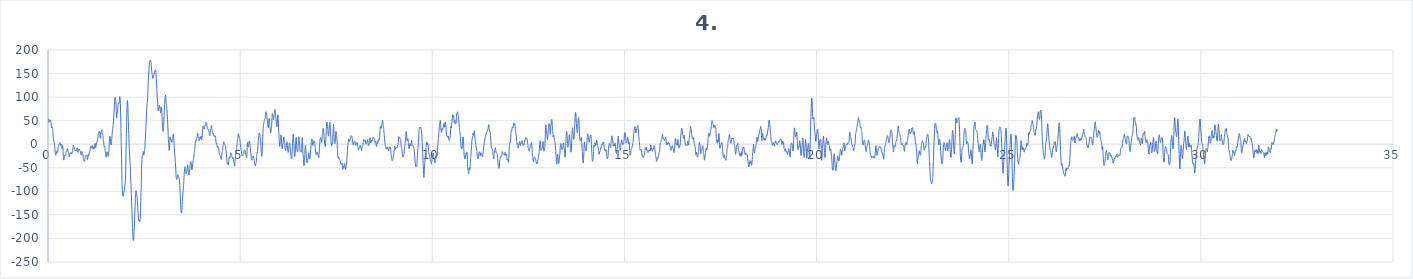
| Category | 4. kanál |
|---|---|
| 0.0 | 47.4 |
| 0.0078125 | 54.3 |
| 0.015625 | 52.2 |
| 0.0234375 | 46.2 |
| 0.03125 | 48.5 |
| 0.0390625 | 52.1 |
| 0.046875 | 50.6 |
| 0.0546875 | 50 |
| 0.0625 | 51 |
| 0.0703125 | 49.9 |
| 0.078125 | 46.2 |
| 0.0859375 | 39.7 |
| 0.09375 | 34.9 |
| 0.1015625 | 35.7 |
| 0.109375 | 36.8 |
| 0.1171875 | 33.7 |
| 0.125 | 27.7 |
| 0.1328125 | 20 |
| 0.140625 | 12.1 |
| 0.1484375 | 7 |
| 0.15625 | 6 |
| 0.1640625 | 3.8 |
| 0.171875 | -4 |
| 0.1796875 | -11.8 |
| 0.1875 | -16.5 |
| 0.1953125 | -21.4 |
| 0.203125 | -23.6 |
| 0.2109375 | -21.3 |
| 0.21875 | -18.7 |
| 0.2265625 | -16.2 |
| 0.234375 | -14 |
| 0.2421875 | -15.8 |
| 0.25 | -17.4 |
| 0.2578125 | -12.1 |
| 0.265625 | -5.2 |
| 0.2734375 | -3 |
| 0.28125 | -1.3 |
| 0.2890625 | 0.6 |
| 0.296875 | 1.2 |
| 0.3046875 | 3.5 |
| 0.3125 | 3.5 |
| 0.3203125 | -1.3 |
| 0.328125 | -2.6 |
| 0.3359375 | -0.4 |
| 0.34375 | 0.3 |
| 0.3515625 | 0.2 |
| 0.359375 | -4.4 |
| 0.3671875 | -9.5 |
| 0.375 | -5.6 |
| 0.3828125 | -3.1 |
| 0.390625 | -13.4 |
| 0.3984375 | -26.4 |
| 0.40625 | -32.9 |
| 0.4140625 | -33 |
| 0.421875 | -27.6 |
| 0.4296875 | -23.7 |
| 0.4375 | -24.8 |
| 0.4453125 | -24.9 |
| 0.453125 | -23.7 |
| 0.4609375 | -23.7 |
| 0.46875 | -20 |
| 0.4765625 | -15.5 |
| 0.484375 | -15.9 |
| 0.4921875 | -15.4 |
| 0.5 | -11 |
| 0.5078125 | -9 |
| 0.515625 | -11.8 |
| 0.5234375 | -15.9 |
| 0.53125 | -17.2 |
| 0.5390625 | -18.6 |
| 0.546875 | -24.1 |
| 0.5546875 | -27 |
| 0.5625 | -24.2 |
| 0.5703125 | -21 |
| 0.578125 | -18.8 |
| 0.5859375 | -18.5 |
| 0.59375 | -19.1 |
| 0.6015625 | -17.8 |
| 0.609375 | -18.6 |
| 0.6171875 | -20.9 |
| 0.625 | -18.4 |
| 0.6328125 | -16 |
| 0.640625 | -15.1 |
| 0.6484375 | -9 |
| 0.65625 | -2 |
| 0.6640625 | -2.5 |
| 0.671875 | -5.4 |
| 0.6796875 | -6.2 |
| 0.6875 | -9.3 |
| 0.6953125 | -12.5 |
| 0.703125 | -12.3 |
| 0.7109375 | -13.3 |
| 0.71875 | -14.5 |
| 0.7265625 | -12.5 |
| 0.734375 | -12.6 |
| 0.7421875 | -13.7 |
| 0.75 | -10.4 |
| 0.7578125 | -7.5 |
| 0.765625 | -10.4 |
| 0.7734375 | -16.2 |
| 0.78125 | -17.2 |
| 0.7890625 | -12.6 |
| 0.796875 | -11.1 |
| 0.8046875 | -12 |
| 0.8125 | -10.5 |
| 0.8203125 | -11.3 |
| 0.828125 | -13.5 |
| 0.8359375 | -13.7 |
| 0.84375 | -16.5 |
| 0.8515625 | -20.3 |
| 0.859375 | -22.2 |
| 0.8671875 | -23.2 |
| 0.875 | -19.8 |
| 0.8828125 | -15.1 |
| 0.890625 | -17.3 |
| 0.8984375 | -20.9 |
| 0.90625 | -21.3 |
| 0.9140625 | -24.7 |
| 0.921875 | -30.5 |
| 0.9296875 | -34.2 |
| 0.9375 | -36.2 |
| 0.9453125 | -36.7 |
| 0.953125 | -35.7 |
| 0.9609375 | -32.7 |
| 0.96875 | -27.7 |
| 0.9765625 | -24 |
| 0.984375 | -23.6 |
| 0.9921875 | -24.2 |
| 1.0 | -23.6 |
| 1.0078125 | -23.2 |
| 1.015625 | -26 |
| 1.0234375 | -31.4 |
| 1.03125 | -33.2 |
| 1.0390625 | -27.6 |
| 1.046875 | -21.2 |
| 1.0546875 | -21.9 |
| 1.0625 | -23.7 |
| 1.0703125 | -19.4 |
| 1.078125 | -15.9 |
| 1.0859375 | -16 |
| 1.09375 | -13.4 |
| 1.1015625 | -7.8 |
| 1.109375 | -4.4 |
| 1.1171875 | -5.6 |
| 1.125 | -8.3 |
| 1.1328125 | -7.9 |
| 1.140625 | -5.7 |
| 1.1484375 | -3.5 |
| 1.15625 | -2.7 |
| 1.1640625 | -7.4 |
| 1.171875 | -10.7 |
| 1.1796875 | -7.2 |
| 1.1875 | -5.7 |
| 1.1953125 | -8.4 |
| 1.203125 | -9.6 |
| 1.2109375 | -6.2 |
| 1.21875 | 0.7 |
| 1.2265625 | 1.7 |
| 1.234375 | -5 |
| 1.2421875 | -7.9 |
| 1.25 | -4.4 |
| 1.2578125 | -0.4 |
| 1.265625 | 2.3 |
| 1.2734375 | 4.3 |
| 1.28125 | 6.6 |
| 1.2890625 | 10.3 |
| 1.296875 | 14.8 |
| 1.3046875 | 18.8 |
| 1.3125 | 22.8 |
| 1.3203125 | 26.3 |
| 1.328125 | 26.5 |
| 1.3359375 | 26.6 |
| 1.34375 | 27.1 |
| 1.3515625 | 20.1 |
| 1.359375 | 12.8 |
| 1.3671875 | 18.2 |
| 1.375 | 24.3 |
| 1.3828125 | 23.5 |
| 1.390625 | 27.1 |
| 1.3984375 | 30.6 |
| 1.40625 | 25.5 |
| 1.4140625 | 21.6 |
| 1.421875 | 20.7 |
| 1.4296875 | 15.4 |
| 1.4375 | 10 |
| 1.4453125 | 7.1 |
| 1.453125 | 0.5 |
| 1.4609375 | -6 |
| 1.46875 | -5.6 |
| 1.4765625 | -4.5 |
| 1.484375 | -9.4 |
| 1.4921875 | -16.7 |
| 1.5 | -22.1 |
| 1.5078125 | -26.5 |
| 1.515625 | -27.3 |
| 1.5234375 | -21.7 |
| 1.53125 | -16.6 |
| 1.5390625 | -16.7 |
| 1.546875 | -18 |
| 1.5546875 | -20.9 |
| 1.5625 | -25.5 |
| 1.5703125 | -25.6 |
| 1.578125 | -20.3 |
| 1.5859375 | -11.8 |
| 1.59375 | 0.1 |
| 1.6015625 | 11.5 |
| 1.609375 | 17 |
| 1.6171875 | 15.4 |
| 1.625 | 9.1 |
| 1.6328125 | 1.7 |
| 1.640625 | -1.5 |
| 1.6484375 | 2.7 |
| 1.65625 | 9.3 |
| 1.6640625 | 15.6 |
| 1.671875 | 24 |
| 1.6796875 | 30.3 |
| 1.6875 | 33.5 |
| 1.6953125 | 40.4 |
| 1.703125 | 49.5 |
| 1.7109375 | 57.5 |
| 1.71875 | 67.9 |
| 1.7265625 | 79.5 |
| 1.734375 | 90 |
| 1.7421875 | 97.5 |
| 1.75 | 99.5 |
| 1.7578125 | 97.3 |
| 1.765625 | 91 |
| 1.7734375 | 76.9 |
| 1.78125 | 60.9 |
| 1.7890625 | 56.2 |
| 1.796875 | 62.6 |
| 1.8046875 | 68.6 |
| 1.8125 | 72.4 |
| 1.8203125 | 78.8 |
| 1.828125 | 85.4 |
| 1.8359375 | 87.7 |
| 1.84375 | 86.4 |
| 1.8515625 | 87.6 |
| 1.859375 | 95 |
| 1.8671875 | 101.1 |
| 1.875 | 98.5 |
| 1.8828125 | 87.2 |
| 1.890625 | 64.7 |
| 1.8984375 | 33.2 |
| 1.90625 | 1.7 |
| 1.9140625 | -29.8 |
| 1.921875 | -62.5 |
| 1.9296875 | -88.2 |
| 1.9375 | -102.7 |
| 1.9453125 | -109.3 |
| 1.953125 | -110.2 |
| 1.9609375 | -107.9 |
| 1.96875 | -103.8 |
| 1.9765625 | -100.9 |
| 1.984375 | -101.6 |
| 1.9921875 | -98.8 |
| 2.0 | -90.5 |
| 2.0078125 | -84.4 |
| 2.015625 | -74.2 |
| 2.0234375 | -49 |
| 2.03125 | -16.4 |
| 2.0390625 | 16.8 |
| 2.046875 | 49.9 |
| 2.0546875 | 75 |
| 2.0625 | 89.1 |
| 2.0703125 | 92.9 |
| 2.078125 | 80.7 |
| 2.0859375 | 59.1 |
| 2.09375 | 40.6 |
| 2.1015625 | 22.2 |
| 2.109375 | 1.8 |
| 2.1171875 | -14 |
| 2.125 | -25.5 |
| 2.1328125 | -36.4 |
| 2.140625 | -48.3 |
| 2.1484375 | -63.9 |
| 2.15625 | -81 |
| 2.1640625 | -96.1 |
| 2.171875 | -113.1 |
| 2.1796875 | -132.1 |
| 2.1875 | -149.5 |
| 2.1953125 | -167.5 |
| 2.203125 | -185.4 |
| 2.2109375 | -197.5 |
| 2.21875 | -204 |
| 2.2265625 | -203.8 |
| 2.234375 | -195 |
| 2.2421875 | -182.5 |
| 2.25 | -167.8 |
| 2.2578125 | -150.1 |
| 2.265625 | -132.1 |
| 2.2734375 | -115.3 |
| 2.28125 | -103.1 |
| 2.2890625 | -98.6 |
| 2.296875 | -100.1 |
| 2.3046875 | -105.5 |
| 2.3125 | -110.3 |
| 2.3203125 | -114.3 |
| 2.328125 | -124.6 |
| 2.3359375 | -137.9 |
| 2.34375 | -146.5 |
| 2.3515625 | -154.2 |
| 2.359375 | -161.3 |
| 2.3671875 | -162.8 |
| 2.375 | -160.7 |
| 2.3828125 | -161.4 |
| 2.390625 | -164 |
| 2.3984375 | -159.3 |
| 2.40625 | -144 |
| 2.4140625 | -123 |
| 2.421875 | -97.7 |
| 2.4296875 | -69.7 |
| 2.4375 | -47.1 |
| 2.4453125 | -31.8 |
| 2.453125 | -23.9 |
| 2.4609375 | -22.6 |
| 2.46875 | -19.7 |
| 2.4765625 | -15.4 |
| 2.484375 | -18.8 |
| 2.4921875 | -23.4 |
| 2.5 | -21.2 |
| 2.5078125 | -18.4 |
| 2.515625 | -13.8 |
| 2.5234375 | -2.5 |
| 2.53125 | 10.7 |
| 2.5390625 | 23.9 |
| 2.546875 | 37.4 |
| 2.5546875 | 49.2 |
| 2.5625 | 61.3 |
| 2.5703125 | 74.3 |
| 2.578125 | 83.5 |
| 2.5859375 | 89.5 |
| 2.59375 | 99.1 |
| 2.6015625 | 115.2 |
| 2.609375 | 133 |
| 2.6171875 | 146.2 |
| 2.625 | 155.8 |
| 2.6328125 | 165.9 |
| 2.640625 | 174.3 |
| 2.6484375 | 176.2 |
| 2.65625 | 176.4 |
| 2.6640625 | 178.8 |
| 2.671875 | 177.6 |
| 2.6796875 | 172.6 |
| 2.6875 | 167.2 |
| 2.6953125 | 158.8 |
| 2.703125 | 151.5 |
| 2.7109375 | 149.8 |
| 2.71875 | 145.3 |
| 2.7265625 | 139.7 |
| 2.734375 | 142.1 |
| 2.7421875 | 145.5 |
| 2.75 | 145.5 |
| 2.7578125 | 147.6 |
| 2.765625 | 151.4 |
| 2.7734375 | 154.1 |
| 2.78125 | 156.3 |
| 2.7890625 | 157.7 |
| 2.796875 | 158.2 |
| 2.8046875 | 155.4 |
| 2.8125 | 148 |
| 2.8203125 | 138.1 |
| 2.828125 | 125.1 |
| 2.8359375 | 110.7 |
| 2.84375 | 99 |
| 2.8515625 | 89.4 |
| 2.859375 | 79.7 |
| 2.8671875 | 72 |
| 2.875 | 70.9 |
| 2.8828125 | 76 |
| 2.890625 | 81.2 |
| 2.8984375 | 82.9 |
| 2.90625 | 81.1 |
| 2.9140625 | 77.2 |
| 2.921875 | 72 |
| 2.9296875 | 66.8 |
| 2.9375 | 67.8 |
| 2.9453125 | 76.2 |
| 2.953125 | 78.8 |
| 2.9609375 | 70 |
| 2.96875 | 56 |
| 2.9765625 | 40.7 |
| 2.984375 | 29.9 |
| 2.9921875 | 27.1 |
| 3.0 | 28.4 |
| 3.0078125 | 35.4 |
| 3.015625 | 49.5 |
| 3.0234375 | 64.7 |
| 3.03125 | 77.7 |
| 3.0390625 | 88.8 |
| 3.046875 | 98.3 |
| 3.0546875 | 104.1 |
| 3.0625 | 100.7 |
| 3.0703125 | 91.9 |
| 3.078125 | 86.3 |
| 3.0859375 | 82.5 |
| 3.09375 | 75.6 |
| 3.1015625 | 64.8 |
| 3.109375 | 52.5 |
| 3.1171875 | 39.7 |
| 3.125 | 24.1 |
| 3.1328125 | 9.3 |
| 3.140625 | 1.2 |
| 3.1484375 | -7.2 |
| 3.15625 | -13.2 |
| 3.1640625 | -3.9 |
| 3.171875 | 11.4 |
| 3.1796875 | 15.9 |
| 3.1875 | 12.1 |
| 3.1953125 | 8.7 |
| 3.203125 | 9 |
| 3.2109375 | 9.6 |
| 3.21875 | 5.4 |
| 3.2265625 | 4 |
| 3.234375 | 9.1 |
| 3.2421875 | 11.8 |
| 3.25 | 14.6 |
| 3.2578125 | 21.7 |
| 3.265625 | 21.1 |
| 3.2734375 | 11.3 |
| 3.28125 | 2.2 |
| 3.2890625 | -7.1 |
| 3.296875 | -18.4 |
| 3.3046875 | -27.9 |
| 3.3125 | -36.4 |
| 3.3203125 | -46.6 |
| 3.328125 | -59.9 |
| 3.3359375 | -70.8 |
| 3.34375 | -73.1 |
| 3.3515625 | -73.7 |
| 3.359375 | -74.8 |
| 3.3671875 | -69.2 |
| 3.375 | -64.7 |
| 3.3828125 | -67.4 |
| 3.390625 | -68.8 |
| 3.3984375 | -69.1 |
| 3.40625 | -71.5 |
| 3.4140625 | -72.6 |
| 3.421875 | -77.3 |
| 3.4296875 | -88.1 |
| 3.4375 | -98.8 |
| 3.4453125 | -112.4 |
| 3.453125 | -130.1 |
| 3.4609375 | -141.8 |
| 3.46875 | -145.3 |
| 3.4765625 | -145.7 |
| 3.484375 | -140.4 |
| 3.4921875 | -128.2 |
| 3.5 | -116.4 |
| 3.5078125 | -107.3 |
| 3.515625 | -98.8 |
| 3.5234375 | -91.8 |
| 3.53125 | -83.1 |
| 3.5390625 | -70.4 |
| 3.546875 | -59.2 |
| 3.5546875 | -51.5 |
| 3.5625 | -47.9 |
| 3.5703125 | -51 |
| 3.578125 | -55.3 |
| 3.5859375 | -57.5 |
| 3.59375 | -62 |
| 3.6015625 | -63.4 |
| 3.609375 | -58.2 |
| 3.6171875 | -54.7 |
| 3.625 | -50.4 |
| 3.6328125 | -43.5 |
| 3.640625 | -47 |
| 3.6484375 | -57.5 |
| 3.65625 | -62.1 |
| 3.6640625 | -64.4 |
| 3.671875 | -65.7 |
| 3.6796875 | -60.6 |
| 3.6875 | -52.7 |
| 3.6953125 | -46 |
| 3.703125 | -40.3 |
| 3.7109375 | -37.1 |
| 3.71875 | -37 |
| 3.7265625 | -42 |
| 3.734375 | -50.2 |
| 3.7421875 | -54.7 |
| 3.75 | -53.5 |
| 3.7578125 | -49.5 |
| 3.765625 | -43 |
| 3.7734375 | -35.7 |
| 3.78125 | -32.4 |
| 3.7890625 | -31.2 |
| 3.796875 | -25.7 |
| 3.8046875 | -19.2 |
| 3.8125 | -16.1 |
| 3.8203125 | -11.2 |
| 3.828125 | -2.8 |
| 3.8359375 | 5.1 |
| 3.84375 | 8.9 |
| 3.8515625 | 7.4 |
| 3.859375 | 7.8 |
| 3.8671875 | 12.5 |
| 3.875 | 13.3 |
| 3.8828125 | 15.2 |
| 3.890625 | 22.1 |
| 3.8984375 | 22.8 |
| 3.90625 | 16.4 |
| 3.9140625 | 12.3 |
| 3.921875 | 11.1 |
| 3.9296875 | 9.3 |
| 3.9375 | 7.4 |
| 3.9453125 | 10 |
| 3.953125 | 14.8 |
| 3.9609375 | 13.5 |
| 3.96875 | 11.9 |
| 3.9765625 | 16.2 |
| 3.984375 | 17.1 |
| 3.9921875 | 11.7 |
| 4.0 | 8.9 |
| 4.0078125 | 12.1 |
| 4.015625 | 19.5 |
| 4.0234375 | 29.1 |
| 4.03125 | 37 |
| 4.0390625 | 39 |
| 4.046875 | 37.4 |
| 4.0546875 | 35.9 |
| 4.0625 | 32.9 |
| 4.0703125 | 32.5 |
| 4.078125 | 37.8 |
| 4.0859375 | 40.4 |
| 4.09375 | 40 |
| 4.1015625 | 43.4 |
| 4.109375 | 46.3 |
| 4.1171875 | 46.1 |
| 4.125 | 45.2 |
| 4.1328125 | 41.5 |
| 4.140625 | 36.1 |
| 4.1484375 | 32.8 |
| 4.15625 | 31.8 |
| 4.1640625 | 31.7 |
| 4.171875 | 31.2 |
| 4.1796875 | 30 |
| 4.1875 | 27.2 |
| 4.1953125 | 22.4 |
| 4.203125 | 18.7 |
| 4.2109375 | 17.9 |
| 4.21875 | 21.8 |
| 4.2265625 | 29 |
| 4.234375 | 32.2 |
| 4.2421875 | 33.5 |
| 4.25 | 38.9 |
| 4.2578125 | 39.5 |
| 4.265625 | 32.7 |
| 4.2734375 | 28.4 |
| 4.28125 | 25.6 |
| 4.2890625 | 22.6 |
| 4.296875 | 23.6 |
| 4.3046875 | 22.6 |
| 4.3125 | 17.9 |
| 4.3203125 | 17.2 |
| 4.328125 | 18.7 |
| 4.3359375 | 17.2 |
| 4.34375 | 15.1 |
| 4.3515625 | 15.9 |
| 4.359375 | 16 |
| 4.3671875 | 9.1 |
| 4.375 | 1.4 |
| 4.3828125 | 1.9 |
| 4.390625 | 2.3 |
| 4.3984375 | -3.8 |
| 4.40625 | -7 |
| 4.4140625 | -5.1 |
| 4.421875 | -5.3 |
| 4.4296875 | -6.2 |
| 4.4375 | -5.6 |
| 4.4453125 | -9.4 |
| 4.453125 | -16.9 |
| 4.4609375 | -21.1 |
| 4.46875 | -22.5 |
| 4.4765625 | -23.7 |
| 4.484375 | -24.4 |
| 4.4921875 | -26.5 |
| 4.5 | -30.2 |
| 4.5078125 | -32.4 |
| 4.515625 | -29.8 |
| 4.5234375 | -21.8 |
| 4.53125 | -16.7 |
| 4.5390625 | -15.8 |
| 4.546875 | -10 |
| 4.5546875 | -2.7 |
| 4.5625 | 0.5 |
| 4.5703125 | 3.9 |
| 4.578125 | 5.2 |
| 4.5859375 | 1.7 |
| 4.59375 | -0.9 |
| 4.6015625 | -1.1 |
| 4.609375 | -1.1 |
| 4.6171875 | -2.8 |
| 4.625 | -7.8 |
| 4.6328125 | -13.8 |
| 4.640625 | -19.9 |
| 4.6484375 | -27.2 |
| 4.65625 | -34.7 |
| 4.6640625 | -40.6 |
| 4.671875 | -41.3 |
| 4.6796875 | -39.4 |
| 4.6875 | -42.2 |
| 4.6953125 | -43.9 |
| 4.703125 | -37.1 |
| 4.7109375 | -29.9 |
| 4.71875 | -27.4 |
| 4.7265625 | -27.9 |
| 4.734375 | -29.7 |
| 4.7421875 | -25.8 |
| 4.75 | -18.7 |
| 4.7578125 | -18.4 |
| 4.765625 | -19.8 |
| 4.7734375 | -20 |
| 4.78125 | -24.6 |
| 4.7890625 | -27.8 |
| 4.796875 | -28.4 |
| 4.8046875 | -31.1 |
| 4.8125 | -30.4 |
| 4.8203125 | -28.6 |
| 4.828125 | -33.1 |
| 4.8359375 | -37.9 |
| 4.84375 | -41.7 |
| 4.8515625 | -46.8 |
| 4.859375 | -45.1 |
| 4.8671875 | -36.3 |
| 4.875 | -28.8 |
| 4.8828125 | -24 |
| 4.890625 | -19.9 |
| 4.8984375 | -16.5 |
| 4.90625 | -12.3 |
| 4.9140625 | -5.4 |
| 4.921875 | 3 |
| 4.9296875 | 8.4 |
| 4.9375 | 12 |
| 4.9453125 | 18 |
| 4.953125 | 22.4 |
| 4.9609375 | 21.1 |
| 4.96875 | 17.8 |
| 4.9765625 | 15.4 |
| 4.984375 | 13.4 |
| 4.9921875 | 10 |
| 5.0 | 4.3 |
| 5.0078125 | -1.6 |
| 5.015625 | -6.7 |
| 5.0234375 | -10.4 |
| 5.03125 | -12.9 |
| 5.0390625 | -18.6 |
| 5.046875 | -24.3 |
| 5.0546875 | -24.6 |
| 5.0625 | -24.6 |
| 5.0703125 | -24.2 |
| 5.078125 | -21.1 |
| 5.0859375 | -20.8 |
| 5.09375 | -20.4 |
| 5.1015625 | -15.7 |
| 5.109375 | -12.7 |
| 5.1171875 | -12.3 |
| 5.125 | -12.1 |
| 5.1328125 | -13.5 |
| 5.140625 | -16.7 |
| 5.1484375 | -20.9 |
| 5.15625 | -23.7 |
| 5.1640625 | -27.2 |
| 5.171875 | -28.8 |
| 5.1796875 | -16 |
| 5.1875 | 2 |
| 5.1953125 | 3.9 |
| 5.203125 | -3.5 |
| 5.2109375 | -5.7 |
| 5.21875 | -4 |
| 5.2265625 | -0.2 |
| 5.234375 | 4.7 |
| 5.2421875 | 7 |
| 5.25 | 4.5 |
| 5.2578125 | -1.9 |
| 5.265625 | -9.2 |
| 5.2734375 | -15.8 |
| 5.28125 | -22 |
| 5.2890625 | -27.8 |
| 5.296875 | -32.2 |
| 5.3046875 | -32.5 |
| 5.3125 | -31.4 |
| 5.3203125 | -32 |
| 5.328125 | -29.6 |
| 5.3359375 | -25.2 |
| 5.34375 | -26.4 |
| 5.3515625 | -29.5 |
| 5.359375 | -30.2 |
| 5.3671875 | -34.5 |
| 5.375 | -40.8 |
| 5.3828125 | -43.3 |
| 5.390625 | -45.2 |
| 5.3984375 | -46 |
| 5.40625 | -42.3 |
| 5.4140625 | -39.3 |
| 5.421875 | -36.1 |
| 5.4296875 | -25.9 |
| 5.4375 | -17.9 |
| 5.4453125 | -18.6 |
| 5.453125 | -16.2 |
| 5.4609375 | -5.6 |
| 5.46875 | 4.8 |
| 5.4765625 | 11.1 |
| 5.484375 | 16.6 |
| 5.4921875 | 22.6 |
| 5.5 | 24.1 |
| 5.5078125 | 20.6 |
| 5.515625 | 18.6 |
| 5.5234375 | 15.6 |
| 5.53125 | 6.4 |
| 5.5390625 | -3 |
| 5.546875 | -10.9 |
| 5.5546875 | -20.7 |
| 5.5625 | -25.9 |
| 5.5703125 | -20 |
| 5.578125 | -7.3 |
| 5.5859375 | 8.4 |
| 5.59375 | 24.8 |
| 5.6015625 | 36.4 |
| 5.609375 | 41.8 |
| 5.6171875 | 44.9 |
| 5.625 | 48.4 |
| 5.6328125 | 51.8 |
| 5.640625 | 53.2 |
| 5.6484375 | 54.1 |
| 5.65625 | 59.7 |
| 5.6640625 | 67 |
| 5.671875 | 69 |
| 5.6796875 | 67.4 |
| 5.6875 | 63.8 |
| 5.6953125 | 58 |
| 5.703125 | 53.8 |
| 5.7109375 | 49.3 |
| 5.71875 | 41.9 |
| 5.7265625 | 36.2 |
| 5.734375 | 35 |
| 5.7421875 | 41.4 |
| 5.75 | 53.1 |
| 5.7578125 | 54.9 |
| 5.765625 | 46.3 |
| 5.7734375 | 39.9 |
| 5.78125 | 32.7 |
| 5.7890625 | 23.9 |
| 5.796875 | 23.7 |
| 5.8046875 | 28.9 |
| 5.8125 | 31.8 |
| 5.8203125 | 39.1 |
| 5.828125 | 54.8 |
| 5.8359375 | 65.4 |
| 5.84375 | 64.7 |
| 5.8515625 | 61.7 |
| 5.859375 | 57.2 |
| 5.8671875 | 51.6 |
| 5.875 | 54.1 |
| 5.8828125 | 60.3 |
| 5.890625 | 63.1 |
| 5.8984375 | 68.3 |
| 5.90625 | 73.9 |
| 5.9140625 | 72.1 |
| 5.921875 | 65 |
| 5.9296875 | 56.2 |
| 5.9375 | 47.9 |
| 5.9453125 | 41.9 |
| 5.953125 | 37.1 |
| 5.9609375 | 38.1 |
| 5.96875 | 49.1 |
| 5.9765625 | 61.3 |
| 5.984375 | 62.4 |
| 5.9921875 | 51.8 |
| 6.0 | 36.9 |
| 6.0078125 | 22.7 |
| 6.015625 | 9.7 |
| 6.0234375 | -1.7 |
| 6.03125 | -4.6 |
| 6.0390625 | 2.6 |
| 6.046875 | 7.7 |
| 6.0546875 | 11.2 |
| 6.0625 | 19.9 |
| 6.0703125 | 19.1 |
| 6.078125 | 4.4 |
| 6.0859375 | -6 |
| 6.09375 | -9.6 |
| 6.1015625 | -9.1 |
| 6.109375 | -1.1 |
| 6.1171875 | 5.1 |
| 6.125 | 7.9 |
| 6.1328125 | 14.5 |
| 6.140625 | 15.6 |
| 6.1484375 | 8.9 |
| 6.15625 | 3.9 |
| 6.1640625 | -2.1 |
| 6.171875 | -10.2 |
| 6.1796875 | -13.6 |
| 6.1875 | -13.2 |
| 6.1953125 | -10.1 |
| 6.203125 | -2.9 |
| 6.2109375 | 3.8 |
| 6.21875 | 5.2 |
| 6.2265625 | 0.9 |
| 6.234375 | -6.9 |
| 6.2421875 | -14.6 |
| 6.25 | -17.4 |
| 6.2578125 | -14.1 |
| 6.265625 | -8.2 |
| 6.2734375 | -2.4 |
| 6.28125 | 2.1 |
| 6.2890625 | 2.8 |
| 6.296875 | -1.6 |
| 6.3046875 | -8.8 |
| 6.3125 | -17.1 |
| 6.3203125 | -25.2 |
| 6.328125 | -29.8 |
| 6.3359375 | -30.8 |
| 6.34375 | -30.5 |
| 6.3515625 | -23.2 |
| 6.359375 | -6.5 |
| 6.3671875 | 9.2 |
| 6.375 | 18.2 |
| 6.3828125 | 21.6 |
| 6.390625 | 15.2 |
| 6.3984375 | 1.9 |
| 6.40625 | -9.9 |
| 6.4140625 | -20.5 |
| 6.421875 | -26.4 |
| 6.4296875 | -21.6 |
| 6.4375 | -11.4 |
| 6.4453125 | 0.9 |
| 6.453125 | 14.1 |
| 6.4609375 | 14.4 |
| 6.46875 | 0 |
| 6.4765625 | -10.8 |
| 6.484375 | -13.6 |
| 6.4921875 | -16.7 |
| 6.5 | -16.1 |
| 6.5078125 | -7.1 |
| 6.515625 | 5.2 |
| 6.5234375 | 14.2 |
| 6.53125 | 16.1 |
| 6.5390625 | 11.9 |
| 6.546875 | 3.4 |
| 6.5546875 | -8 |
| 6.5625 | -14.8 |
| 6.5703125 | -13.7 |
| 6.578125 | -13.5 |
| 6.5859375 | -16.6 |
| 6.59375 | -16.4 |
| 6.6015625 | -9.1 |
| 6.609375 | 5.5 |
| 6.6171875 | 14.1 |
| 6.625 | 3.9 |
| 6.6328125 | -13.9 |
| 6.640625 | -26.8 |
| 6.6484375 | -38 |
| 6.65625 | -45.7 |
| 6.6640625 | -45 |
| 6.671875 | -39.3 |
| 6.6796875 | -29.3 |
| 6.6875 | -13.9 |
| 6.6953125 | -2.7 |
| 6.703125 | -4.1 |
| 6.7109375 | -12.2 |
| 6.71875 | -21 |
| 6.7265625 | -30.8 |
| 6.734375 | -37.9 |
| 6.7421875 | -39.8 |
| 6.75 | -38.2 |
| 6.7578125 | -33.6 |
| 6.765625 | -30.3 |
| 6.7734375 | -27.8 |
| 6.78125 | -21.1 |
| 6.7890625 | -18.2 |
| 6.796875 | -24.7 |
| 6.8046875 | -31 |
| 6.8125 | -31 |
| 6.8203125 | -26.9 |
| 6.828125 | -20.2 |
| 6.8359375 | -12.1 |
| 6.84375 | -3.4 |
| 6.8515625 | 3.5 |
| 6.859375 | 7.7 |
| 6.8671875 | 11.1 |
| 6.875 | 9.1 |
| 6.8828125 | 0.6 |
| 6.890625 | -3 |
| 6.8984375 | 0 |
| 6.90625 | 2.6 |
| 6.9140625 | 5.6 |
| 6.921875 | 7.5 |
| 6.9296875 | 6.3 |
| 6.9375 | 6.2 |
| 6.9453125 | 1.7 |
| 6.953125 | -10 |
| 6.9609375 | -17.6 |
| 6.96875 | -20 |
| 6.9765625 | -22.1 |
| 6.984375 | -19.7 |
| 6.9921875 | -16.4 |
| 7.0 | -16.9 |
| 7.0078125 | -16.8 |
| 7.015625 | -18.1 |
| 7.0234375 | -23 |
| 7.03125 | -26.2 |
| 7.0390625 | -27.6 |
| 7.046875 | -28 |
| 7.0546875 | -21.8 |
| 7.0625 | -9.9 |
| 7.0703125 | 0.8 |
| 7.078125 | 8.6 |
| 7.0859375 | 13.1 |
| 7.09375 | 13.5 |
| 7.1015625 | 13.1 |
| 7.109375 | 10.9 |
| 7.1171875 | 4.4 |
| 7.125 | 4.7 |
| 7.1328125 | 15.4 |
| 7.140625 | 22.8 |
| 7.1484375 | 27 |
| 7.15625 | 33.1 |
| 7.1640625 | 32.7 |
| 7.171875 | 27.4 |
| 7.1796875 | 22 |
| 7.1875 | 11.8 |
| 7.1953125 | 2.7 |
| 7.203125 | -0.5 |
| 7.2109375 | -4.9 |
| 7.21875 | -4.4 |
| 7.2265625 | 7.1 |
| 7.234375 | 19.3 |
| 7.2421875 | 30.4 |
| 7.25 | 42.7 |
| 7.2578125 | 47.2 |
| 7.265625 | 45.1 |
| 7.2734375 | 41.2 |
| 7.28125 | 31.9 |
| 7.2890625 | 22 |
| 7.296875 | 17.3 |
| 7.3046875 | 17.6 |
| 7.3125 | 27 |
| 7.3203125 | 39.6 |
| 7.328125 | 45.4 |
| 7.3359375 | 47.4 |
| 7.34375 | 42.4 |
| 7.3515625 | 26.4 |
| 7.359375 | 12 |
| 7.3671875 | 4 |
| 7.375 | -1.8 |
| 7.3828125 | -2.9 |
| 7.390625 | -1.2 |
| 7.3984375 | 0.5 |
| 7.40625 | 6 |
| 7.4140625 | 17.3 |
| 7.421875 | 32.9 |
| 7.4296875 | 41.8 |
| 7.4375 | 33.4 |
| 7.4453125 | 16.9 |
| 7.453125 | 6.3 |
| 7.4609375 | 1.7 |
| 7.46875 | 2 |
| 7.4765625 | 9 |
| 7.484375 | 19.9 |
| 7.4921875 | 27 |
| 7.5 | 25.8 |
| 7.5078125 | 21 |
| 7.515625 | 15.2 |
| 7.5234375 | 4.9 |
| 7.53125 | -9.6 |
| 7.5390625 | -23.1 |
| 7.546875 | -29.1 |
| 7.5546875 | -27.2 |
| 7.5625 | -27 |
| 7.5703125 | -30.7 |
| 7.578125 | -30.8 |
| 7.5859375 | -29.9 |
| 7.59375 | -31.9 |
| 7.6015625 | -34 |
| 7.609375 | -37.6 |
| 7.6171875 | -42 |
| 7.625 | -41.9 |
| 7.6328125 | -41.1 |
| 7.640625 | -42.7 |
| 7.6484375 | -41.4 |
| 7.65625 | -40.3 |
| 7.6640625 | -46.6 |
| 7.671875 | -52.8 |
| 7.6796875 | -50.1 |
| 7.6875 | -47.6 |
| 7.6953125 | -50.5 |
| 7.703125 | -48 |
| 7.7109375 | -41.4 |
| 7.71875 | -41.9 |
| 7.7265625 | -46.4 |
| 7.734375 | -50.6 |
| 7.7421875 | -53.7 |
| 7.75 | -51.1 |
| 7.7578125 | -46.8 |
| 7.765625 | -44.6 |
| 7.7734375 | -38.4 |
| 7.78125 | -28.5 |
| 7.7890625 | -18.4 |
| 7.796875 | -8.1 |
| 7.8046875 | -0.4 |
| 7.8125 | 5.4 |
| 7.8203125 | 10.8 |
| 7.828125 | 10.4 |
| 7.8359375 | 6.7 |
| 7.84375 | 5.6 |
| 7.8515625 | 5.8 |
| 7.859375 | 7.9 |
| 7.8671875 | 10.7 |
| 7.875 | 12.2 |
| 7.8828125 | 15.9 |
| 7.890625 | 18.2 |
| 7.8984375 | 16.2 |
| 7.90625 | 16.9 |
| 7.9140625 | 13.9 |
| 7.921875 | 4.5 |
| 7.9296875 | 2.1 |
| 7.9375 | 2.2 |
| 7.9453125 | -2.2 |
| 7.953125 | -0.2 |
| 7.9609375 | 5 |
| 7.96875 | 6.2 |
| 7.9765625 | 6.9 |
| 7.984375 | 6.1 |
| 7.9921875 | 3.5 |
| 8.0 | 0.6 |
| 8.0078125 | -2.3 |
| 8.015625 | -1.3 |
| 8.0234375 | 0.2 |
| 8.03125 | 0.5 |
| 8.0390625 | 3.7 |
| 8.046875 | 2.8 |
| 8.0546875 | -2.6 |
| 8.0625 | -5 |
| 8.0703125 | -8.7 |
| 8.078125 | -12.5 |
| 8.0859375 | -10.5 |
| 8.09375 | -8.4 |
| 8.1015625 | -8.4 |
| 8.109375 | -7.5 |
| 8.1171875 | -4.7 |
| 8.125 | -1.7 |
| 8.1328125 | -3.5 |
| 8.140625 | -6.5 |
| 8.1484375 | -8.5 |
| 8.15625 | -13.2 |
| 8.1640625 | -12.8 |
| 8.171875 | -6.9 |
| 8.1796875 | -5.8 |
| 8.1875 | -4.6 |
| 8.1953125 | -0.3 |
| 8.203125 | 3.4 |
| 8.2109375 | 8.4 |
| 8.21875 | 10.6 |
| 8.2265625 | 8 |
| 8.234375 | 6.4 |
| 8.2421875 | 6.2 |
| 8.25 | 7.7 |
| 8.2578125 | 8.9 |
| 8.265625 | 4.4 |
| 8.2734375 | 0 |
| 8.28125 | 1.3 |
| 8.2890625 | 4.1 |
| 8.296875 | 5 |
| 8.3046875 | 6.1 |
| 8.3125 | 10.1 |
| 8.3203125 | 10.6 |
| 8.328125 | 2.7 |
| 8.3359375 | -3.4 |
| 8.34375 | -2.8 |
| 8.3515625 | -0.1 |
| 8.359375 | 4 |
| 8.3671875 | 8.2 |
| 8.375 | 11.5 |
| 8.3828125 | 13.6 |
| 8.390625 | 8.8 |
| 8.3984375 | 2.2 |
| 8.40625 | 4.6 |
| 8.4140625 | 8.7 |
| 8.421875 | 7.1 |
| 8.4296875 | 6.8 |
| 8.4375 | 8.2 |
| 8.4453125 | 9.3 |
| 8.453125 | 12.8 |
| 8.4609375 | 14.4 |
| 8.46875 | 13.4 |
| 8.4765625 | 14.4 |
| 8.484375 | 14.1 |
| 8.4921875 | 11.6 |
| 8.5 | 9.1 |
| 8.5078125 | 4.6 |
| 8.515625 | 3.6 |
| 8.5234375 | 6.9 |
| 8.53125 | 3.3 |
| 8.5390625 | -3.8 |
| 8.546875 | -4.8 |
| 8.5546875 | -1.6 |
| 8.5625 | 3.3 |
| 8.5703125 | 5.2 |
| 8.578125 | 1.5 |
| 8.5859375 | 3.9 |
| 8.59375 | 10.1 |
| 8.6015625 | 8.1 |
| 8.609375 | 7.5 |
| 8.6171875 | 12.1 |
| 8.625 | 11.7 |
| 8.6328125 | 15.5 |
| 8.640625 | 29.4 |
| 8.6484375 | 38.7 |
| 8.65625 | 38.5 |
| 8.6640625 | 34.9 |
| 8.671875 | 33.6 |
| 8.6796875 | 37.5 |
| 8.6875 | 41.2 |
| 8.6953125 | 44.7 |
| 8.703125 | 51.1 |
| 8.7109375 | 50.2 |
| 8.71875 | 42 |
| 8.7265625 | 38.8 |
| 8.734375 | 35.8 |
| 8.7421875 | 26.1 |
| 8.75 | 17.9 |
| 8.7578125 | 12.9 |
| 8.765625 | 5 |
| 8.7734375 | -1.2 |
| 8.78125 | -3.4 |
| 8.7890625 | -7.1 |
| 8.796875 | -9.1 |
| 8.8046875 | -8.2 |
| 8.8125 | -10.6 |
| 8.8203125 | -10.2 |
| 8.828125 | -5.6 |
| 8.8359375 | -6.8 |
| 8.84375 | -9.7 |
| 8.8515625 | -10.4 |
| 8.859375 | -13.9 |
| 8.8671875 | -13.6 |
| 8.875 | -8.1 |
| 8.8828125 | -5.8 |
| 8.890625 | -6.5 |
| 8.8984375 | -8.1 |
| 8.90625 | -7.9 |
| 8.9140625 | -6.7 |
| 8.921875 | -13.2 |
| 8.9296875 | -22.4 |
| 8.9375 | -26.3 |
| 8.9453125 | -30.5 |
| 8.953125 | -34.7 |
| 8.9609375 | -34.4 |
| 8.96875 | -33.1 |
| 8.9765625 | -31 |
| 8.984375 | -27.3 |
| 8.9921875 | -23.6 |
| 9.0 | -18.8 |
| 9.0078125 | -12.8 |
| 9.015625 | -6.9 |
| 9.0234375 | -4.1 |
| 9.03125 | -7.6 |
| 9.0390625 | -11 |
| 9.046875 | -8.7 |
| 9.0546875 | -7.1 |
| 9.0625 | -8.4 |
| 9.0703125 | -7.2 |
| 9.078125 | -6.4 |
| 9.0859375 | -7.8 |
| 9.09375 | -5.1 |
| 9.1015625 | -1.4 |
| 9.109375 | -0.4 |
| 9.1171875 | 6.5 |
| 9.125 | 16 |
| 9.1328125 | 16 |
| 9.140625 | 12.1 |
| 9.1484375 | 13 |
| 9.15625 | 13.5 |
| 9.1640625 | 11.9 |
| 9.171875 | 11.1 |
| 9.1796875 | 7.4 |
| 9.1875 | -1 |
| 9.1953125 | -7 |
| 9.203125 | -7.8 |
| 9.2109375 | -10.6 |
| 9.21875 | -18.9 |
| 9.2265625 | -25.8 |
| 9.234375 | -27.4 |
| 9.2421875 | -27 |
| 9.25 | -25.7 |
| 9.2578125 | -23.4 |
| 9.265625 | -19.6 |
| 9.2734375 | -12 |
| 9.28125 | -5.4 |
| 9.2890625 | -2.1 |
| 9.296875 | 5 |
| 9.3046875 | 13.6 |
| 9.3125 | 20 |
| 9.3203125 | 27 |
| 9.328125 | 25.6 |
| 9.3359375 | 14 |
| 9.34375 | 7.2 |
| 9.3515625 | 7.9 |
| 9.359375 | 11.2 |
| 9.3671875 | 12 |
| 9.375 | 3 |
| 9.3828125 | -6.4 |
| 9.390625 | -7.7 |
| 9.3984375 | -9.1 |
| 9.40625 | -7.9 |
| 9.4140625 | -0.9 |
| 9.421875 | 1.4 |
| 9.4296875 | -0.2 |
| 9.4375 | -1.7 |
| 9.4453125 | -3.5 |
| 9.453125 | 1.2 |
| 9.4609375 | 7.7 |
| 9.46875 | 4.5 |
| 9.4765625 | -0.5 |
| 9.484375 | -0.8 |
| 9.4921875 | -2.9 |
| 9.5 | -4.7 |
| 9.5078125 | -4.1 |
| 9.515625 | -6.3 |
| 9.5234375 | -9.7 |
| 9.53125 | -14.4 |
| 9.5390625 | -22.9 |
| 9.546875 | -30.3 |
| 9.5546875 | -36.9 |
| 9.5625 | -44.2 |
| 9.5703125 | -47.6 |
| 9.578125 | -47.8 |
| 9.5859375 | -47.8 |
| 9.59375 | -46.6 |
| 9.6015625 | -41.6 |
| 9.609375 | -30.4 |
| 9.6171875 | -17.3 |
| 9.625 | -9.6 |
| 9.6328125 | -5.9 |
| 9.640625 | 2 |
| 9.6484375 | 17.4 |
| 9.65625 | 31 |
| 9.6640625 | 35 |
| 9.671875 | 36.1 |
| 9.6796875 | 36.6 |
| 9.6875 | 34.7 |
| 9.6953125 | 35.1 |
| 9.703125 | 35.5 |
| 9.7109375 | 32.1 |
| 9.71875 | 28.4 |
| 9.7265625 | 21.5 |
| 9.734375 | 9.6 |
| 9.7421875 | -3.6 |
| 9.75 | -20.1 |
| 9.7578125 | -35.9 |
| 9.765625 | -47.7 |
| 9.7734375 | -62.2 |
| 9.78125 | -70.6 |
| 9.7890625 | -61.4 |
| 9.796875 | -48.1 |
| 9.8046875 | -40.5 |
| 9.8125 | -32.4 |
| 9.8203125 | -22.1 |
| 9.828125 | -13 |
| 9.8359375 | -7.8 |
| 9.84375 | -3 |
| 9.8515625 | 4.2 |
| 9.859375 | 4.5 |
| 9.8671875 | -1.3 |
| 9.875 | -0.5 |
| 9.8828125 | 2.7 |
| 9.890625 | -0.4 |
| 9.8984375 | -7.7 |
| 9.90625 | -16.1 |
| 9.9140625 | -21 |
| 9.921875 | -22.2 |
| 9.9296875 | -24.6 |
| 9.9375 | -27.7 |
| 9.9453125 | -31.9 |
| 9.953125 | -35.9 |
| 9.9609375 | -35.6 |
| 9.96875 | -37.4 |
| 9.9765625 | -41.7 |
| 9.984375 | -39.2 |
| 9.9921875 | -32.4 |
| 10.0 | -27.4 |
| 10.0078125 | -22.9 |
| 10.015625 | -19.6 |
| 10.0234375 | -18.8 |
| 10.03125 | -22.7 |
| 10.0390625 | -29.3 |
| 10.046875 | -30.7 |
| 10.0546875 | -30.8 |
| 10.0625 | -36.9 |
| 10.0703125 | -39.4 |
| 10.078125 | -34.2 |
| 10.0859375 | -31.5 |
| 10.09375 | -31.8 |
| 10.1015625 | -28.5 |
| 10.109375 | -24.2 |
| 10.1171875 | -24.3 |
| 10.125 | -25.2 |
| 10.1328125 | -18.8 |
| 10.140625 | -6.3 |
| 10.1484375 | 3.9 |
| 10.15625 | 9.4 |
| 10.1640625 | 15.4 |
| 10.171875 | 24.5 |
| 10.1796875 | 34.4 |
| 10.1875 | 41.6 |
| 10.1953125 | 46.2 |
| 10.203125 | 50.5 |
| 10.2109375 | 50.5 |
| 10.21875 | 41.2 |
| 10.2265625 | 29.8 |
| 10.234375 | 25.2 |
| 10.2421875 | 27.3 |
| 10.25 | 32.2 |
| 10.2578125 | 33.4 |
| 10.265625 | 30.9 |
| 10.2734375 | 31.8 |
| 10.28125 | 36.1 |
| 10.2890625 | 39.3 |
| 10.296875 | 42.9 |
| 10.3046875 | 43.6 |
| 10.3125 | 38.5 |
| 10.3203125 | 35.9 |
| 10.328125 | 41.5 |
| 10.3359375 | 46.8 |
| 10.34375 | 45.3 |
| 10.3515625 | 39.9 |
| 10.359375 | 33 |
| 10.3671875 | 23.8 |
| 10.375 | 17.8 |
| 10.3828125 | 17.8 |
| 10.390625 | 16.8 |
| 10.3984375 | 14.9 |
| 10.40625 | 16.8 |
| 10.4140625 | 17.3 |
| 10.421875 | 13.1 |
| 10.4296875 | 9.7 |
| 10.4375 | 8 |
| 10.4453125 | 8.2 |
| 10.453125 | 10.9 |
| 10.4609375 | 12.6 |
| 10.46875 | 18.2 |
| 10.4765625 | 31.7 |
| 10.484375 | 38.1 |
| 10.4921875 | 34.3 |
| 10.5 | 37.8 |
| 10.5078125 | 46.5 |
| 10.515625 | 50.8 |
| 10.5234375 | 57.4 |
| 10.53125 | 63.1 |
| 10.5390625 | 60.7 |
| 10.546875 | 59.5 |
| 10.5546875 | 60.5 |
| 10.5625 | 53.5 |
| 10.5703125 | 46.1 |
| 10.578125 | 48.7 |
| 10.5859375 | 50.9 |
| 10.59375 | 45.3 |
| 10.6015625 | 42.6 |
| 10.609375 | 43.5 |
| 10.6171875 | 43.6 |
| 10.625 | 51.2 |
| 10.6328125 | 62 |
| 10.640625 | 65.3 |
| 10.6484375 | 67.6 |
| 10.65625 | 69 |
| 10.6640625 | 65.1 |
| 10.671875 | 62.3 |
| 10.6796875 | 59.1 |
| 10.6875 | 51.8 |
| 10.6953125 | 44.5 |
| 10.703125 | 37.6 |
| 10.7109375 | 31.7 |
| 10.71875 | 26.8 |
| 10.7265625 | 20 |
| 10.734375 | 10.9 |
| 10.7421875 | 1 |
| 10.75 | -5.3 |
| 10.7578125 | -7.3 |
| 10.765625 | -10 |
| 10.7734375 | -9.9 |
| 10.78125 | -1.9 |
| 10.7890625 | 8.7 |
| 10.796875 | 15.8 |
| 10.8046875 | 15.2 |
| 10.8125 | 5 |
| 10.8203125 | -9.3 |
| 10.828125 | -20.6 |
| 10.8359375 | -27.3 |
| 10.84375 | -31.1 |
| 10.8515625 | -31 |
| 10.859375 | -27.5 |
| 10.8671875 | -24.3 |
| 10.875 | -20 |
| 10.8828125 | -18.3 |
| 10.890625 | -21.7 |
| 10.8984375 | -19.3 |
| 10.90625 | -17.3 |
| 10.9140625 | -32.6 |
| 10.921875 | -50.2 |
| 10.9296875 | -54.6 |
| 10.9375 | -57.8 |
| 10.9453125 | -62.5 |
| 10.953125 | -58.2 |
| 10.9609375 | -49.8 |
| 10.96875 | -49.7 |
| 10.9765625 | -53.8 |
| 10.984375 | -49.4 |
| 10.9921875 | -38.8 |
| 11.0 | -28.4 |
| 11.0078125 | -18.9 |
| 11.015625 | -11.9 |
| 11.0234375 | -2.9 |
| 11.03125 | 8.8 |
| 11.0390625 | 12.7 |
| 11.046875 | 12 |
| 11.0546875 | 17.5 |
| 11.0625 | 23.6 |
| 11.0703125 | 22.5 |
| 11.078125 | 19 |
| 11.0859375 | 22.1 |
| 11.09375 | 28.4 |
| 11.1015625 | 24.7 |
| 11.109375 | 13.6 |
| 11.1171875 | 7.3 |
| 11.125 | 3.7 |
| 11.1328125 | -0.7 |
| 11.140625 | -5.1 |
| 11.1484375 | -10.1 |
| 11.15625 | -13.6 |
| 11.1640625 | -17.1 |
| 11.171875 | -25.4 |
| 11.1796875 | -30.8 |
| 11.1875 | -29.1 |
| 11.1953125 | -29.5 |
| 11.203125 | -28.5 |
| 11.2109375 | -21.1 |
| 11.21875 | -17.3 |
| 11.2265625 | -17.3 |
| 11.234375 | -16.1 |
| 11.2421875 | -20.5 |
| 11.25 | -24.5 |
| 11.2578125 | -19.8 |
| 11.265625 | -18.2 |
| 11.2734375 | -20.8 |
| 11.28125 | -19.8 |
| 11.2890625 | -21.8 |
| 11.296875 | -26.5 |
| 11.3046875 | -26.5 |
| 11.3125 | -23.8 |
| 11.3203125 | -18.9 |
| 11.328125 | -13 |
| 11.3359375 | -8.6 |
| 11.34375 | -2.9 |
| 11.3515625 | 2.9 |
| 11.359375 | 6.5 |
| 11.3671875 | 9.6 |
| 11.375 | 12.5 |
| 11.3828125 | 15.9 |
| 11.390625 | 19.7 |
| 11.3984375 | 22.1 |
| 11.40625 | 24.1 |
| 11.4140625 | 25.4 |
| 11.421875 | 25.7 |
| 11.4296875 | 28.5 |
| 11.4375 | 31.3 |
| 11.4453125 | 31 |
| 11.453125 | 33.6 |
| 11.4609375 | 39.6 |
| 11.46875 | 41.7 |
| 11.4765625 | 38.5 |
| 11.484375 | 33 |
| 11.4921875 | 27.9 |
| 11.5 | 26.1 |
| 11.5078125 | 24.9 |
| 11.515625 | 18.7 |
| 11.5234375 | 8.2 |
| 11.53125 | -1.9 |
| 11.5390625 | -7.6 |
| 11.546875 | -9.3 |
| 11.5546875 | -9.8 |
| 11.5625 | -9.9 |
| 11.5703125 | -12.6 |
| 11.578125 | -20.1 |
| 11.5859375 | -26.6 |
| 11.59375 | -30.1 |
| 11.6015625 | -31 |
| 11.609375 | -24 |
| 11.6171875 | -14.6 |
| 11.625 | -12.2 |
| 11.6328125 | -10.6 |
| 11.640625 | -7.4 |
| 11.6484375 | -10.5 |
| 11.65625 | -16.9 |
| 11.6640625 | -18.5 |
| 11.671875 | -17.8 |
| 11.6796875 | -19.6 |
| 11.6875 | -20.4 |
| 11.6953125 | -21.6 |
| 11.703125 | -30.7 |
| 11.7109375 | -41.4 |
| 11.71875 | -43.5 |
| 11.7265625 | -45.3 |
| 11.734375 | -51.5 |
| 11.7421875 | -49.5 |
| 11.75 | -38.8 |
| 11.7578125 | -32.8 |
| 11.765625 | -31.6 |
| 11.7734375 | -28.1 |
| 11.78125 | -25.5 |
| 11.7890625 | -26.1 |
| 11.796875 | -26.1 |
| 11.8046875 | -24.2 |
| 11.8125 | -20.3 |
| 11.8203125 | -15.8 |
| 11.828125 | -15.9 |
| 11.8359375 | -18.4 |
| 11.84375 | -18.9 |
| 11.8515625 | -20 |
| 11.859375 | -21.5 |
| 11.8671875 | -22.8 |
| 11.875 | -23.5 |
| 11.8828125 | -20.1 |
| 11.890625 | -17.1 |
| 11.8984375 | -19.7 |
| 11.90625 | -22.2 |
| 11.9140625 | -23.4 |
| 11.921875 | -22.5 |
| 11.9296875 | -20.5 |
| 11.9375 | -26.5 |
| 11.9453125 | -33.7 |
| 11.953125 | -32 |
| 11.9609375 | -31.7 |
| 11.96875 | -34.7 |
| 11.9765625 | -36.2 |
| 11.984375 | -38.3 |
| 11.9921875 | -30.9 |
| 12.0 | -13.3 |
| 12.0078125 | -2.1 |
| 12.015625 | 2.3 |
| 12.0234375 | 4.8 |
| 12.03125 | 3.8 |
| 12.0390625 | 9.1 |
| 12.046875 | 22.3 |
| 12.0546875 | 28.3 |
| 12.0625 | 27.4 |
| 12.0703125 | 29.9 |
| 12.078125 | 34.7 |
| 12.0859375 | 36.6 |
| 12.09375 | 35.6 |
| 12.1015625 | 34.8 |
| 12.109375 | 39.3 |
| 12.1171875 | 45.2 |
| 12.125 | 44.3 |
| 12.1328125 | 41.6 |
| 12.140625 | 43 |
| 12.1484375 | 42.8 |
| 12.15625 | 37 |
| 12.1640625 | 30.5 |
| 12.171875 | 27.3 |
| 12.1796875 | 23 |
| 12.1875 | 15.4 |
| 12.1953125 | 8.5 |
| 12.203125 | 2.8 |
| 12.2109375 | -0.1 |
| 12.21875 | 1 |
| 12.2265625 | -2.5 |
| 12.234375 | -8.1 |
| 12.2421875 | -4.7 |
| 12.25 | -0.5 |
| 12.2578125 | -0.7 |
| 12.265625 | 2.8 |
| 12.2734375 | 5.9 |
| 12.28125 | 2.6 |
| 12.2890625 | -2 |
| 12.296875 | -2.7 |
| 12.3046875 | 0.6 |
| 12.3125 | 2.2 |
| 12.3203125 | 1.8 |
| 12.328125 | 5.5 |
| 12.3359375 | 7.5 |
| 12.34375 | 3.9 |
| 12.3515625 | 1.4 |
| 12.359375 | -1.1 |
| 12.3671875 | -3.9 |
| 12.375 | -1.9 |
| 12.3828125 | -0.8 |
| 12.390625 | -1.4 |
| 12.3984375 | 4 |
| 12.40625 | 8.9 |
| 12.4140625 | 8.4 |
| 12.421875 | 10.6 |
| 12.4296875 | 14.4 |
| 12.4375 | 13.6 |
| 12.4453125 | 11.8 |
| 12.453125 | 12.2 |
| 12.4609375 | 12.5 |
| 12.46875 | 10.6 |
| 12.4765625 | 6.4 |
| 12.484375 | -0.2 |
| 12.4921875 | -6.5 |
| 12.5 | -8.5 |
| 12.5078125 | -9.7 |
| 12.515625 | -13.9 |
| 12.5234375 | -15 |
| 12.53125 | -11.6 |
| 12.5390625 | -8.3 |
| 12.546875 | -4.4 |
| 12.5546875 | -1.9 |
| 12.5625 | -2 |
| 12.5703125 | 0.2 |
| 12.578125 | 3.3 |
| 12.5859375 | 1.5 |
| 12.59375 | -6.3 |
| 12.6015625 | -17.1 |
| 12.609375 | -24 |
| 12.6171875 | -28 |
| 12.625 | -34.5 |
| 12.6328125 | -38.1 |
| 12.640625 | -34.4 |
| 12.6484375 | -29.9 |
| 12.65625 | -27.8 |
| 12.6640625 | -27 |
| 12.671875 | -27.6 |
| 12.6796875 | -29.9 |
| 12.6875 | -32.1 |
| 12.6953125 | -34.3 |
| 12.703125 | -39.1 |
| 12.7109375 | -42 |
| 12.71875 | -38.9 |
| 12.7265625 | -38.6 |
| 12.734375 | -41 |
| 12.7421875 | -37.3 |
| 12.75 | -32.7 |
| 12.7578125 | -30.6 |
| 12.765625 | -25.3 |
| 12.7734375 | -19.8 |
| 12.78125 | -15.1 |
| 12.7890625 | -7.9 |
| 12.796875 | -0.4 |
| 12.8046875 | 6.5 |
| 12.8125 | 7.2 |
| 12.8203125 | -3.9 |
| 12.828125 | -13.7 |
| 12.8359375 | -12.7 |
| 12.84375 | -10.9 |
| 12.8515625 | -10.8 |
| 12.859375 | -8 |
| 12.8671875 | -2.7 |
| 12.875 | 5.1 |
| 12.8828125 | 6 |
| 12.890625 | -5.7 |
| 12.8984375 | -14.8 |
| 12.90625 | -14.5 |
| 12.9140625 | -13.9 |
| 12.921875 | -12 |
| 12.9296875 | -3.5 |
| 12.9375 | 12.9 |
| 12.9453125 | 32.2 |
| 12.953125 | 41.1 |
| 12.9609375 | 35.9 |
| 12.96875 | 28.4 |
| 12.9765625 | 23.8 |
| 12.984375 | 17.8 |
| 12.9921875 | 11.1 |
| 13.0 | 10.3 |
| 13.0078125 | 17.2 |
| 13.015625 | 25.9 |
| 13.0234375 | 33.6 |
| 13.03125 | 40.6 |
| 13.0390625 | 43.8 |
| 13.046875 | 42.9 |
| 13.0546875 | 39.9 |
| 13.0625 | 31.1 |
| 13.0703125 | 21.1 |
| 13.078125 | 24.1 |
| 13.0859375 | 36.9 |
| 13.09375 | 45 |
| 13.1015625 | 49.6 |
| 13.109375 | 53 |
| 13.1171875 | 47.5 |
| 13.125 | 37.1 |
| 13.1328125 | 29.5 |
| 13.140625 | 20.8 |
| 13.1484375 | 15 |
| 13.15625 | 17.7 |
| 13.1640625 | 18.7 |
| 13.171875 | 12.9 |
| 13.1796875 | 8.4 |
| 13.1875 | 7.1 |
| 13.1953125 | 3.6 |
| 13.203125 | -3.7 |
| 13.2109375 | -13.2 |
| 13.21875 | -23.5 |
| 13.2265625 | -34 |
| 13.234375 | -42.2 |
| 13.2421875 | -42.3 |
| 13.25 | -31.9 |
| 13.2578125 | -21 |
| 13.265625 | -22 |
| 13.2734375 | -29.7 |
| 13.28125 | -35.2 |
| 13.2890625 | -40.8 |
| 13.296875 | -39.7 |
| 13.3046875 | -29.4 |
| 13.3125 | -24.7 |
| 13.3203125 | -20.8 |
| 13.328125 | -7.8 |
| 13.3359375 | 0.6 |
| 13.34375 | 1.5 |
| 13.3515625 | 0.5 |
| 13.359375 | -5.9 |
| 13.3671875 | -10.6 |
| 13.375 | -9.6 |
| 13.3828125 | -10.7 |
| 13.390625 | -10.7 |
| 13.3984375 | -5.9 |
| 13.40625 | -0.2 |
| 13.4140625 | 2.4 |
| 13.421875 | -1.3 |
| 13.4296875 | -7 |
| 13.4375 | -12.8 |
| 13.4453125 | -21.6 |
| 13.453125 | -27.6 |
| 13.4609375 | -24.6 |
| 13.46875 | -12.3 |
| 13.4765625 | 5.7 |
| 13.484375 | 19.5 |
| 13.4921875 | 25.2 |
| 13.5 | 26.5 |
| 13.5078125 | 20.9 |
| 13.515625 | 8.1 |
| 13.5234375 | -3.3 |
| 13.53125 | -6.2 |
| 13.5390625 | -2.6 |
| 13.546875 | 1.8 |
| 13.5546875 | 9.8 |
| 13.5625 | 19.4 |
| 13.5703125 | 20.5 |
| 13.578125 | 14.6 |
| 13.5859375 | 6.9 |
| 13.59375 | -2.8 |
| 13.6015625 | -11.7 |
| 13.609375 | -17 |
| 13.6171875 | -14.1 |
| 13.625 | 0.5 |
| 13.6328125 | 17 |
| 13.640625 | 28.5 |
| 13.6484375 | 35.2 |
| 13.65625 | 32.7 |
| 13.6640625 | 23.7 |
| 13.671875 | 15.8 |
| 13.6796875 | 10.5 |
| 13.6875 | 10.7 |
| 13.6953125 | 19.1 |
| 13.703125 | 32.4 |
| 13.7109375 | 46.9 |
| 13.71875 | 59.6 |
| 13.7265625 | 67.4 |
| 13.734375 | 67.1 |
| 13.7421875 | 56.9 |
| 13.75 | 43.6 |
| 13.7578125 | 34.6 |
| 13.765625 | 28.6 |
| 13.7734375 | 24.6 |
| 13.78125 | 28.6 |
| 13.7890625 | 40.6 |
| 13.796875 | 52.1 |
| 13.8046875 | 56.8 |
| 13.8125 | 53.6 |
| 13.8203125 | 43 |
| 13.828125 | 28.7 |
| 13.8359375 | 15.7 |
| 13.84375 | 8.2 |
| 13.8515625 | 7.2 |
| 13.859375 | 8.8 |
| 13.8671875 | 11.3 |
| 13.875 | 14.5 |
| 13.8828125 | 13.1 |
| 13.890625 | 3.6 |
| 13.8984375 | -9.2 |
| 13.90625 | -22.1 |
| 13.9140625 | -32.5 |
| 13.921875 | -37.9 |
| 13.9296875 | -40 |
| 13.9375 | -34 |
| 13.9453125 | -15.8 |
| 13.953125 | 1.4 |
| 13.9609375 | 5.1 |
| 13.96875 | -1.2 |
| 13.9765625 | -6.7 |
| 13.984375 | -7.5 |
| 13.9921875 | -10.1 |
| 14.0 | -14.7 |
| 14.0078125 | -12 |
| 14.015625 | -4.2 |
| 14.0234375 | 3.2 |
| 14.03125 | 13.7 |
| 14.0390625 | 22 |
| 14.046875 | 21.1 |
| 14.0546875 | 17.4 |
| 14.0625 | 13.7 |
| 14.0703125 | 8.2 |
| 14.078125 | 4.3 |
| 14.0859375 | 4.8 |
| 14.09375 | 9.1 |
| 14.1015625 | 14.2 |
| 14.109375 | 16.3 |
| 14.1171875 | 17.9 |
| 14.125 | 19.9 |
| 14.1328125 | 15.5 |
| 14.140625 | 2.4 |
| 14.1484375 | -12.8 |
| 14.15625 | -25.5 |
| 14.1640625 | -34.4 |
| 14.171875 | -36.2 |
| 14.1796875 | -32.3 |
| 14.1875 | -28 |
| 14.1953125 | -18.9 |
| 14.203125 | -5.7 |
| 14.2109375 | -2.1 |
| 14.21875 | -4.5 |
| 14.2265625 | 0.2 |
| 14.234375 | 3.2 |
| 14.2421875 | -1.4 |
| 14.25 | -3.2 |
| 14.2578125 | -1.3 |
| 14.265625 | 1.8 |
| 14.2734375 | 7.5 |
| 14.28125 | 8.9 |
| 14.2890625 | 2.9 |
| 14.296875 | -2.1 |
| 14.3046875 | -4.3 |
| 14.3125 | -6.2 |
| 14.3203125 | -8 |
| 14.328125 | -13.7 |
| 14.3359375 | -21.2 |
| 14.34375 | -21.3 |
| 14.3515625 | -16.6 |
| 14.359375 | -15.8 |
| 14.3671875 | -15.3 |
| 14.375 | -10.3 |
| 14.3828125 | -7.5 |
| 14.390625 | -9 |
| 14.3984375 | -5.7 |
| 14.40625 | -0.2 |
| 14.4140625 | -1.5 |
| 14.421875 | -1.5 |
| 14.4296875 | 3.4 |
| 14.4375 | 3.1 |
| 14.4453125 | 1.4 |
| 14.453125 | 4.2 |
| 14.4609375 | 3.8 |
| 14.46875 | -1.2 |
| 14.4765625 | -7.3 |
| 14.484375 | -11.3 |
| 14.4921875 | -10.5 |
| 14.5 | -11.4 |
| 14.5078125 | -14.7 |
| 14.515625 | -12.8 |
| 14.5234375 | -11.3 |
| 14.53125 | -17.9 |
| 14.5390625 | -26.1 |
| 14.546875 | -30.3 |
| 14.5546875 | -31.3 |
| 14.5625 | -30.3 |
| 14.5703125 | -26.9 |
| 14.578125 | -18.7 |
| 14.5859375 | -9 |
| 14.59375 | -3.4 |
| 14.6015625 | -0.4 |
| 14.609375 | 1.8 |
| 14.6171875 | 0.8 |
| 14.625 | -2.7 |
| 14.6328125 | -6.2 |
| 14.640625 | -6.9 |
| 14.6484375 | -1.7 |
| 14.65625 | 6.1 |
| 14.6640625 | 12.3 |
| 14.671875 | 17.2 |
| 14.6796875 | 17.3 |
| 14.6875 | 11.7 |
| 14.6953125 | 7.2 |
| 14.703125 | 2 |
| 14.7109375 | -4.1 |
| 14.71875 | -3.1 |
| 14.7265625 | -0.8 |
| 14.734375 | -3.6 |
| 14.7421875 | -3 |
| 14.75 | 1.6 |
| 14.7578125 | 2.8 |
| 14.765625 | -1.3 |
| 14.7734375 | -9.6 |
| 14.78125 | -16.8 |
| 14.7890625 | -19.8 |
| 14.796875 | -19.6 |
| 14.8046875 | -14.7 |
| 14.8125 | -7.9 |
| 14.8203125 | -1.6 |
| 14.828125 | 9 |
| 14.8359375 | 17.3 |
| 14.84375 | 14.4 |
| 14.8515625 | 7.6 |
| 14.859375 | 1 |
| 14.8671875 | -5.9 |
| 14.875 | -7.8 |
| 14.8828125 | -8.9 |
| 14.890625 | -13.4 |
| 14.8984375 | -10.8 |
| 14.90625 | -2.4 |
| 14.9140625 | 2.3 |
| 14.921875 | 6.4 |
| 14.9296875 | 9.1 |
| 14.9375 | 6.1 |
| 14.9453125 | 2.9 |
| 14.953125 | 0.6 |
| 14.9609375 | -1.3 |
| 14.96875 | -0.2 |
| 14.9765625 | 0.4 |
| 14.984375 | 2.9 |
| 14.9921875 | 11.3 |
| 15.0 | 19.9 |
| 15.0078125 | 24.9 |
| 15.015625 | 24.4 |
| 15.0234375 | 19.2 |
| 15.03125 | 14.1 |
| 15.0390625 | 7.7 |
| 15.046875 | 2.9 |
| 15.0546875 | 2.7 |
| 15.0625 | 2.7 |
| 15.0703125 | 6.8 |
| 15.078125 | 13.9 |
| 15.0859375 | 14.5 |
| 15.09375 | 11.9 |
| 15.1015625 | 6.9 |
| 15.109375 | 0.5 |
| 15.1171875 | 2.7 |
| 15.125 | 4.1 |
| 15.1328125 | -8 |
| 15.140625 | -19.9 |
| 15.1484375 | -23.1 |
| 15.15625 | -23.2 |
| 15.1640625 | -19.2 |
| 15.171875 | -13.3 |
| 15.1796875 | -10.7 |
| 15.1875 | -9.3 |
| 15.1953125 | -7.3 |
| 15.203125 | -4.4 |
| 15.2109375 | -0.9 |
| 15.21875 | 1.7 |
| 15.2265625 | 5.4 |
| 15.234375 | 13.6 |
| 15.2421875 | 23 |
| 15.25 | 29.8 |
| 15.2578125 | 33.3 |
| 15.265625 | 35 |
| 15.2734375 | 37.7 |
| 15.28125 | 36.1 |
| 15.2890625 | 27.1 |
| 15.296875 | 23.8 |
| 15.3046875 | 29.7 |
| 15.3125 | 32.1 |
| 15.3203125 | 31.8 |
| 15.328125 | 35 |
| 15.3359375 | 36.9 |
| 15.34375 | 37.9 |
| 15.3515625 | 39.5 |
| 15.359375 | 35.3 |
| 15.3671875 | 25.7 |
| 15.375 | 15.9 |
| 15.3828125 | 8.4 |
| 15.390625 | 2.9 |
| 15.3984375 | -4.8 |
| 15.40625 | -12 |
| 15.4140625 | -12.2 |
| 15.421875 | -11.4 |
| 15.4296875 | -12.7 |
| 15.4375 | -11.2 |
| 15.4453125 | -13 |
| 15.453125 | -20.9 |
| 15.4609375 | -24.8 |
| 15.46875 | -23.8 |
| 15.4765625 | -25.4 |
| 15.484375 | -28.4 |
| 15.4921875 | -28.5 |
| 15.5 | -25.8 |
| 15.5078125 | -23.6 |
| 15.515625 | -23.6 |
| 15.5234375 | -21.8 |
| 15.53125 | -15 |
| 15.5390625 | -9.1 |
| 15.546875 | -10.2 |
| 15.5546875 | -11.5 |
| 15.5625 | -7.2 |
| 15.5703125 | -6.2 |
| 15.578125 | -11.1 |
| 15.5859375 | -12.8 |
| 15.59375 | -11.9 |
| 15.6015625 | -14.5 |
| 15.609375 | -17.6 |
| 15.6171875 | -17.1 |
| 15.625 | -14.6 |
| 15.6328125 | -13.6 |
| 15.640625 | -14.9 |
| 15.6484375 | -14.4 |
| 15.65625 | -11.8 |
| 15.6640625 | -13.1 |
| 15.671875 | -13.9 |
| 15.6796875 | -7 |
| 15.6875 | -1.5 |
| 15.6953125 | -3.6 |
| 15.703125 | -6.7 |
| 15.7109375 | -10.1 |
| 15.71875 | -14 |
| 15.7265625 | -14.7 |
| 15.734375 | -13.4 |
| 15.7421875 | -10.6 |
| 15.75 | -8.7 |
| 15.7578125 | -10.4 |
| 15.765625 | -8.2 |
| 15.7734375 | -3 |
| 15.78125 | -4.3 |
| 15.7890625 | -7.9 |
| 15.796875 | -11.5 |
| 15.8046875 | -18.6 |
| 15.8125 | -23.9 |
| 15.8203125 | -27.2 |
| 15.828125 | -32.8 |
| 15.8359375 | -36.5 |
| 15.84375 | -35 |
| 15.8515625 | -31.9 |
| 15.859375 | -29.4 |
| 15.8671875 | -28.3 |
| 15.875 | -28.7 |
| 15.8828125 | -28.5 |
| 15.890625 | -25 |
| 15.8984375 | -19.9 |
| 15.90625 | -17.3 |
| 15.9140625 | -14.8 |
| 15.921875 | -7.8 |
| 15.9296875 | 0.4 |
| 15.9375 | 3.7 |
| 15.9453125 | 4.1 |
| 15.953125 | 6.5 |
| 15.9609375 | 9.6 |
| 15.96875 | 10.1 |
| 15.9765625 | 12.4 |
| 15.984375 | 19 |
| 15.9921875 | 21.4 |
| 16.0 | 15.8 |
| 16.0078125 | 11.1 |
| 16.015625 | 11.7 |
| 16.0234375 | 11.1 |
| 16.03125 | 8.7 |
| 16.0390625 | 8.3 |
| 16.046875 | 8.2 |
| 16.0546875 | 9.2 |
| 16.0625 | 13.2 |
| 16.0703125 | 15.3 |
| 16.078125 | 12.3 |
| 16.0859375 | 7.3 |
| 16.09375 | 2.5 |
| 16.1015625 | -1.6 |
| 16.109375 | -1.3 |
| 16.1171875 | 2.3 |
| 16.125 | 2 |
| 16.1328125 | 0.7 |
| 16.140625 | 4.2 |
| 16.1484375 | 4.8 |
| 16.15625 | 1.8 |
| 16.1640625 | 2.3 |
| 16.171875 | 1.1 |
| 16.1796875 | -3.9 |
| 16.1875 | -5.5 |
| 16.1953125 | -5.2 |
| 16.203125 | -8.9 |
| 16.2109375 | -13 |
| 16.21875 | -11.1 |
| 16.2265625 | -6.7 |
| 16.234375 | -5.5 |
| 16.2421875 | -4.2 |
| 16.25 | -3.1 |
| 16.2578125 | -5.8 |
| 16.265625 | -8.3 |
| 16.2734375 | -12 |
| 16.28125 | -17.3 |
| 16.2890625 | -17 |
| 16.296875 | -15.5 |
| 16.3046875 | -13.7 |
| 16.3125 | -2.8 |
| 16.3203125 | 9.5 |
| 16.328125 | 12.6 |
| 16.3359375 | 9.3 |
| 16.34375 | 2.2 |
| 16.3515625 | -1.7 |
| 16.359375 | 1.2 |
| 16.3671875 | 0.6 |
| 16.375 | -2.2 |
| 16.3828125 | 3.6 |
| 16.390625 | 10.2 |
| 16.3984375 | 7.2 |
| 16.40625 | -0.1 |
| 16.4140625 | -6 |
| 16.421875 | -8.3 |
| 16.4296875 | -5.1 |
| 16.4375 | -2.3 |
| 16.4453125 | -3 |
| 16.453125 | 1 |
| 16.4609375 | 9.8 |
| 16.46875 | 17.3 |
| 16.4765625 | 25.7 |
| 16.484375 | 33.3 |
| 16.4921875 | 33.9 |
| 16.5 | 30.4 |
| 16.5078125 | 26.7 |
| 16.515625 | 22.2 |
| 16.5234375 | 18.9 |
| 16.53125 | 15.7 |
| 16.5390625 | 12.2 |
| 16.546875 | 14.3 |
| 16.5546875 | 19 |
| 16.5625 | 16.4 |
| 16.5703125 | 9.5 |
| 16.578125 | 4.7 |
| 16.5859375 | 0.5 |
| 16.59375 | -2.3 |
| 16.6015625 | -1.9 |
| 16.609375 | -1.3 |
| 16.6171875 | -2.4 |
| 16.625 | -3.4 |
| 16.6328125 | -1.5 |
| 16.640625 | 3.8 |
| 16.6484375 | 6.9 |
| 16.65625 | 3.1 |
| 16.6640625 | -1.7 |
| 16.671875 | 0 |
| 16.6796875 | 5.9 |
| 16.6875 | 12 |
| 16.6953125 | 17.8 |
| 16.703125 | 23.8 |
| 16.7109375 | 30.5 |
| 16.71875 | 36.3 |
| 16.7265625 | 37.1 |
| 16.734375 | 31.6 |
| 16.7421875 | 25 |
| 16.75 | 20.6 |
| 16.7578125 | 15.8 |
| 16.765625 | 12.4 |
| 16.7734375 | 12.8 |
| 16.78125 | 11.6 |
| 16.7890625 | 10.5 |
| 16.796875 | 13.7 |
| 16.8046875 | 11 |
| 16.8125 | 2.8 |
| 16.8203125 | 0 |
| 16.828125 | -1.9 |
| 16.8359375 | -5 |
| 16.84375 | -7.7 |
| 16.8515625 | -16 |
| 16.859375 | -22.5 |
| 16.8671875 | -18.8 |
| 16.875 | -16.6 |
| 16.8828125 | -20.5 |
| 16.890625 | -24.4 |
| 16.8984375 | -27.5 |
| 16.90625 | -27 |
| 16.9140625 | -22.2 |
| 16.921875 | -18.6 |
| 16.9296875 | -15.3 |
| 16.9375 | -7.2 |
| 16.9453125 | 1.9 |
| 16.953125 | 3.9 |
| 16.9609375 | 0.6 |
| 16.96875 | -3.8 |
| 16.9765625 | -12.4 |
| 16.984375 | -20.8 |
| 16.9921875 | -19.5 |
| 17.0 | -15.1 |
| 17.0078125 | -13.9 |
| 17.015625 | -10.4 |
| 17.0234375 | -5.7 |
| 17.03125 | -3.5 |
| 17.0390625 | -3.2 |
| 17.046875 | -7.8 |
| 17.0546875 | -15.2 |
| 17.0625 | -19.6 |
| 17.0703125 | -25.1 |
| 17.078125 | -32.9 |
| 17.0859375 | -33.8 |
| 17.09375 | -27.4 |
| 17.1015625 | -21.9 |
| 17.109375 | -17.6 |
| 17.1171875 | -11.9 |
| 17.125 | -8 |
| 17.1328125 | -9 |
| 17.140625 | -12.2 |
| 17.1484375 | -12.2 |
| 17.15625 | -7.4 |
| 17.1640625 | -1.4 |
| 17.171875 | 5.3 |
| 17.1796875 | 14.8 |
| 17.1875 | 22.6 |
| 17.1953125 | 23.6 |
| 17.203125 | 21.3 |
| 17.2109375 | 19.2 |
| 17.21875 | 16.9 |
| 17.2265625 | 18.5 |
| 17.234375 | 25 |
| 17.2421875 | 28.8 |
| 17.25 | 30.1 |
| 17.2578125 | 36.2 |
| 17.265625 | 43.9 |
| 17.2734375 | 48.2 |
| 17.28125 | 50.1 |
| 17.2890625 | 47.8 |
| 17.296875 | 44.2 |
| 17.3046875 | 43.5 |
| 17.3125 | 40.8 |
| 17.3203125 | 35.9 |
| 17.328125 | 34.6 |
| 17.3359375 | 35.3 |
| 17.34375 | 37.7 |
| 17.3515625 | 40.7 |
| 17.359375 | 38.5 |
| 17.3671875 | 35.2 |
| 17.375 | 34.1 |
| 17.3828125 | 26.9 |
| 17.390625 | 16 |
| 17.3984375 | 9.2 |
| 17.40625 | 3.9 |
| 17.4140625 | 2.2 |
| 17.421875 | 7.7 |
| 17.4296875 | 9.7 |
| 17.4375 | 4.4 |
| 17.4453125 | 5.3 |
| 17.453125 | 16.9 |
| 17.4609375 | 22.8 |
| 17.46875 | 11.3 |
| 17.4765625 | -4.1 |
| 17.484375 | -9 |
| 17.4921875 | -7.1 |
| 17.5 | -4.5 |
| 17.5078125 | -1.7 |
| 17.515625 | 0.3 |
| 17.5234375 | 2.5 |
| 17.53125 | 4.1 |
| 17.5390625 | 1.4 |
| 17.546875 | -3.8 |
| 17.5546875 | -10 |
| 17.5625 | -19 |
| 17.5703125 | -25.8 |
| 17.578125 | -27.8 |
| 17.5859375 | -28.5 |
| 17.59375 | -25.5 |
| 17.6015625 | -22.1 |
| 17.609375 | -26.4 |
| 17.6171875 | -30.2 |
| 17.625 | -29.9 |
| 17.6328125 | -33.1 |
| 17.640625 | -34.1 |
| 17.6484375 | -30.2 |
| 17.65625 | -27.3 |
| 17.6640625 | -19.4 |
| 17.671875 | -9.1 |
| 17.6796875 | -7.4 |
| 17.6875 | -5.4 |
| 17.6953125 | 3.8 |
| 17.703125 | 9.8 |
| 17.7109375 | 10.5 |
| 17.71875 | 13.9 |
| 17.7265625 | 19.4 |
| 17.734375 | 20.3 |
| 17.7421875 | 15.1 |
| 17.75 | 9.2 |
| 17.7578125 | 5.5 |
| 17.765625 | 2.4 |
| 17.7734375 | 1.9 |
| 17.78125 | 7.3 |
| 17.7890625 | 11.9 |
| 17.796875 | 11.4 |
| 17.8046875 | 11.9 |
| 17.8125 | 13.6 |
| 17.8203125 | 12 |
| 17.828125 | 11.2 |
| 17.8359375 | 12.7 |
| 17.84375 | 10.2 |
| 17.8515625 | 2.8 |
| 17.859375 | -2.2 |
| 17.8671875 | -2.9 |
| 17.875 | -6.7 |
| 17.8828125 | -15.4 |
| 17.890625 | -21.1 |
| 17.8984375 | -20.5 |
| 17.90625 | -14.8 |
| 17.9140625 | -6.7 |
| 17.921875 | -2.8 |
| 17.9296875 | -2.7 |
| 17.9375 | -0.8 |
| 17.9453125 | 1.9 |
| 17.953125 | 0.3 |
| 17.9609375 | -7.3 |
| 17.96875 | -13.2 |
| 17.9765625 | -14 |
| 17.984375 | -17.4 |
| 17.9921875 | -23 |
| 18.0 | -23.5 |
| 18.0078125 | -21.1 |
| 18.015625 | -19.8 |
| 18.0234375 | -23 |
| 18.03125 | -26.1 |
| 18.0390625 | -20.2 |
| 18.046875 | -15.9 |
| 18.0546875 | -21.7 |
| 18.0625 | -22.3 |
| 18.0703125 | -13.1 |
| 18.078125 | -7.4 |
| 18.0859375 | -8.1 |
| 18.09375 | -8.5 |
| 18.1015625 | -6.1 |
| 18.109375 | -6.8 |
| 18.1171875 | -12.6 |
| 18.125 | -16.8 |
| 18.1328125 | -19.5 |
| 18.140625 | -22.5 |
| 18.1484375 | -21.1 |
| 18.15625 | -18.3 |
| 18.1640625 | -19.6 |
| 18.171875 | -22.1 |
| 18.1796875 | -23.1 |
| 18.1875 | -22.2 |
| 18.1953125 | -22.7 |
| 18.203125 | -28.1 |
| 18.2109375 | -33.5 |
| 18.21875 | -37.5 |
| 18.2265625 | -44 |
| 18.234375 | -47.9 |
| 18.2421875 | -46.9 |
| 18.25 | -44.9 |
| 18.2578125 | -39.8 |
| 18.265625 | -34.8 |
| 18.2734375 | -37.1 |
| 18.28125 | -40.5 |
| 18.2890625 | -38.4 |
| 18.296875 | -36.8 |
| 18.3046875 | -40.6 |
| 18.3125 | -44.3 |
| 18.3203125 | -39.5 |
| 18.328125 | -27.4 |
| 18.3359375 | -17.9 |
| 18.34375 | -13.1 |
| 18.3515625 | -6.4 |
| 18.359375 | 0.4 |
| 18.3671875 | -2.5 |
| 18.375 | -13 |
| 18.3828125 | -18.4 |
| 18.390625 | -15.2 |
| 18.3984375 | -10.7 |
| 18.40625 | -9.5 |
| 18.4140625 | -8.3 |
| 18.421875 | -4.5 |
| 18.4296875 | -1 |
| 18.4375 | 5 |
| 18.4453125 | 13.6 |
| 18.453125 | 15 |
| 18.4609375 | 9.5 |
| 18.46875 | 6.3 |
| 18.4765625 | 6.5 |
| 18.484375 | 10.5 |
| 18.4921875 | 17 |
| 18.5 | 20 |
| 18.5078125 | 22 |
| 18.515625 | 26.3 |
| 18.5234375 | 29.3 |
| 18.53125 | 31.8 |
| 18.5390625 | 35.9 |
| 18.546875 | 37.8 |
| 18.5546875 | 33.7 |
| 18.5625 | 23.9 |
| 18.5703125 | 12.1 |
| 18.578125 | 7.1 |
| 18.5859375 | 15.1 |
| 18.59375 | 23.9 |
| 18.6015625 | 20.4 |
| 18.609375 | 14.4 |
| 18.6171875 | 14.8 |
| 18.625 | 12.5 |
| 18.6328125 | 8.6 |
| 18.640625 | 11.1 |
| 18.6484375 | 13.1 |
| 18.65625 | 9.6 |
| 18.6640625 | 8.2 |
| 18.671875 | 10.6 |
| 18.6796875 | 13.3 |
| 18.6875 | 16.8 |
| 18.6953125 | 20.1 |
| 18.703125 | 19.7 |
| 18.7109375 | 18.7 |
| 18.71875 | 21.5 |
| 18.7265625 | 25.9 |
| 18.734375 | 30.4 |
| 18.7421875 | 35.5 |
| 18.75 | 41 |
| 18.7578125 | 47.5 |
| 18.765625 | 51.1 |
| 18.7734375 | 49.4 |
| 18.78125 | 44.5 |
| 18.7890625 | 36.2 |
| 18.796875 | 27.8 |
| 18.8046875 | 22.1 |
| 18.8125 | 13.4 |
| 18.8203125 | 4.9 |
| 18.828125 | 3.8 |
| 18.8359375 | 3.7 |
| 18.84375 | 0.1 |
| 18.8515625 | -2.9 |
| 18.859375 | -1.9 |
| 18.8671875 | 2.5 |
| 18.875 | 3.4 |
| 18.8828125 | 0.5 |
| 18.890625 | 0.7 |
| 18.8984375 | -1.3 |
| 18.90625 | -4.3 |
| 18.9140625 | 1.6 |
| 18.921875 | 7 |
| 18.9296875 | 4.2 |
| 18.9375 | 3.8 |
| 18.9453125 | 5.1 |
| 18.953125 | 4.2 |
| 18.9609375 | 3.7 |
| 18.96875 | 0.8 |
| 18.9765625 | -1.3 |
| 18.984375 | 1.6 |
| 18.9921875 | 2.7 |
| 19.0 | 3 |
| 19.0078125 | 5.8 |
| 19.015625 | 6.3 |
| 19.0234375 | 5.2 |
| 19.03125 | 4.7 |
| 19.0390625 | 5.5 |
| 19.046875 | 9 |
| 19.0546875 | 11.2 |
| 19.0625 | 10.4 |
| 19.0703125 | 10.3 |
| 19.078125 | 8.5 |
| 19.0859375 | 4 |
| 19.09375 | 0.4 |
| 19.1015625 | -0.8 |
| 19.109375 | 1.9 |
| 19.1171875 | 6.2 |
| 19.125 | 6.4 |
| 19.1328125 | 4.7 |
| 19.140625 | 2.6 |
| 19.1484375 | -3.9 |
| 19.15625 | -9.6 |
| 19.1640625 | -10.3 |
| 19.171875 | -12.8 |
| 19.1796875 | -14.7 |
| 19.1875 | -10.2 |
| 19.1953125 | -9.8 |
| 19.203125 | -15.9 |
| 19.2109375 | -17 |
| 19.21875 | -15.3 |
| 19.2265625 | -16.9 |
| 19.234375 | -19 |
| 19.2421875 | -21.2 |
| 19.25 | -20.9 |
| 19.2578125 | -16.7 |
| 19.265625 | -13.4 |
| 19.2734375 | -10.7 |
| 19.28125 | -9.1 |
| 19.2890625 | -14.1 |
| 19.296875 | -21.4 |
| 19.3046875 | -26.2 |
| 19.3125 | -27.4 |
| 19.3203125 | -20.7 |
| 19.328125 | -8.7 |
| 19.3359375 | 0.2 |
| 19.34375 | 2.9 |
| 19.3515625 | 2 |
| 19.359375 | 1.6 |
| 19.3671875 | -1.2 |
| 19.375 | -9.1 |
| 19.3828125 | -14.4 |
| 19.390625 | -11.9 |
| 19.3984375 | -1.7 |
| 19.40625 | 14.8 |
| 19.4140625 | 28.9 |
| 19.421875 | 34.6 |
| 19.4296875 | 33.9 |
| 19.4375 | 26.6 |
| 19.4453125 | 17.6 |
| 19.453125 | 15.7 |
| 19.4609375 | 16.8 |
| 19.46875 | 17.2 |
| 19.4765625 | 22.5 |
| 19.484375 | 25.8 |
| 19.4921875 | 15.9 |
| 19.5 | 1.9 |
| 19.5078125 | -6.9 |
| 19.515625 | -11.5 |
| 19.5234375 | -9.1 |
| 19.53125 | -5.1 |
| 19.5390625 | -6.6 |
| 19.546875 | -3.7 |
| 19.5546875 | 4.9 |
| 19.5625 | 7.5 |
| 19.5703125 | 4.2 |
| 19.578125 | -4.2 |
| 19.5859375 | -16.4 |
| 19.59375 | -23.2 |
| 19.6015625 | -23.9 |
| 19.609375 | -19.4 |
| 19.6171875 | -8.7 |
| 19.625 | -0.3 |
| 19.6328125 | 6 |
| 19.640625 | 13.1 |
| 19.6484375 | 9.2 |
| 19.65625 | -6 |
| 19.6640625 | -19.1 |
| 19.671875 | -26.3 |
| 19.6796875 | -27.7 |
| 19.6875 | -24.7 |
| 19.6953125 | -15.5 |
| 19.703125 | 1.5 |
| 19.7109375 | 10.1 |
| 19.71875 | 5.4 |
| 19.7265625 | 1.1 |
| 19.734375 | -10.4 |
| 19.7421875 | -28.9 |
| 19.75 | -29.5 |
| 19.7578125 | -17.9 |
| 19.765625 | -12.5 |
| 19.7734375 | -6.8 |
| 19.78125 | 0.2 |
| 19.7890625 | 1.5 |
| 19.796875 | -3.3 |
| 19.8046875 | -16.9 |
| 19.8125 | -31.5 |
| 19.8203125 | -30.9 |
| 19.828125 | -15.2 |
| 19.8359375 | 5.3 |
| 19.84375 | 27.8 |
| 19.8515625 | 52.8 |
| 19.859375 | 76 |
| 19.8671875 | 91.2 |
| 19.875 | 97.8 |
| 19.8828125 | 94.9 |
| 19.890625 | 80.1 |
| 19.8984375 | 61.5 |
| 19.90625 | 53.2 |
| 19.9140625 | 54.9 |
| 19.921875 | 57.1 |
| 19.9296875 | 55.6 |
| 19.9375 | 48.2 |
| 19.9453125 | 36.2 |
| 19.953125 | 27.4 |
| 19.9609375 | 21.6 |
| 19.96875 | 13.2 |
| 19.9765625 | 6.1 |
| 19.984375 | 6.4 |
| 19.9921875 | 12.6 |
| 20.0 | 19.2 |
| 20.0078125 | 23.3 |
| 20.015625 | 27.6 |
| 20.0234375 | 32 |
| 20.03125 | 29.8 |
| 20.0390625 | 22.8 |
| 20.046875 | 14.2 |
| 20.0546875 | 1 |
| 20.0625 | -9.7 |
| 20.0703125 | -6.7 |
| 20.078125 | 3.5 |
| 20.0859375 | 9.3 |
| 20.09375 | 9.7 |
| 20.1015625 | 9.8 |
| 20.109375 | 9.6 |
| 20.1171875 | -0.8 |
| 20.125 | -21.3 |
| 20.1328125 | -34.2 |
| 20.140625 | -30.2 |
| 20.1484375 | -15.6 |
| 20.15625 | -2.5 |
| 20.1640625 | 4.1 |
| 20.171875 | 12.1 |
| 20.1796875 | 17.3 |
| 20.1875 | 9.2 |
| 20.1953125 | -1.6 |
| 20.203125 | -10.9 |
| 20.2109375 | -23.2 |
| 20.21875 | -28.6 |
| 20.2265625 | -24.3 |
| 20.234375 | -14.4 |
| 20.2421875 | -0.6 |
| 20.25 | 7.4 |
| 20.2578125 | 10.3 |
| 20.265625 | 13 |
| 20.2734375 | 8.3 |
| 20.28125 | 0.9 |
| 20.2890625 | -0.2 |
| 20.296875 | 2.7 |
| 20.3046875 | 6 |
| 20.3125 | 4.1 |
| 20.3203125 | -0.5 |
| 20.328125 | -1 |
| 20.3359375 | -4.8 |
| 20.34375 | -12 |
| 20.3515625 | -13.5 |
| 20.359375 | -11.5 |
| 20.3671875 | -9.8 |
| 20.375 | -12.9 |
| 20.3828125 | -20.7 |
| 20.390625 | -26 |
| 20.3984375 | -34.5 |
| 20.40625 | -47.7 |
| 20.4140625 | -53.6 |
| 20.421875 | -55.5 |
| 20.4296875 | -55.4 |
| 20.4375 | -42.4 |
| 20.4453125 | -26.6 |
| 20.453125 | -21 |
| 20.4609375 | -20.6 |
| 20.46875 | -26.9 |
| 20.4765625 | -39.2 |
| 20.484375 | -47.8 |
| 20.4921875 | -53 |
| 20.5 | -56.5 |
| 20.5078125 | -54.3 |
| 20.515625 | -49.3 |
| 20.5234375 | -43.7 |
| 20.53125 | -36.8 |
| 20.5390625 | -30.5 |
| 20.546875 | -25.5 |
| 20.5546875 | -24.7 |
| 20.5625 | -29.8 |
| 20.5703125 | -34.3 |
| 20.578125 | -35.7 |
| 20.5859375 | -35.1 |
| 20.59375 | -31.4 |
| 20.6015625 | -25.8 |
| 20.609375 | -19 |
| 20.6171875 | -12.4 |
| 20.625 | -10.9 |
| 20.6328125 | -11.9 |
| 20.640625 | -13.5 |
| 20.6484375 | -19.8 |
| 20.65625 | -23.5 |
| 20.6640625 | -17.9 |
| 20.671875 | -11.6 |
| 20.6796875 | -8.7 |
| 20.6875 | -7.3 |
| 20.6953125 | -6.1 |
| 20.703125 | -0.9 |
| 20.7109375 | 2.8 |
| 20.71875 | -3.3 |
| 20.7265625 | -12 |
| 20.734375 | -14.3 |
| 20.7421875 | -11.7 |
| 20.75 | -8 |
| 20.7578125 | -5.7 |
| 20.765625 | -3.4 |
| 20.7734375 | -0.8 |
| 20.78125 | -1.2 |
| 20.7890625 | -1.6 |
| 20.796875 | 1.5 |
| 20.8046875 | 3.1 |
| 20.8125 | 1.3 |
| 20.8203125 | 0.9 |
| 20.828125 | 2.7 |
| 20.8359375 | 3.7 |
| 20.84375 | 5.2 |
| 20.8515625 | 13.7 |
| 20.859375 | 25.1 |
| 20.8671875 | 25.8 |
| 20.875 | 17.8 |
| 20.8828125 | 13.7 |
| 20.890625 | 13.6 |
| 20.8984375 | 11.2 |
| 20.90625 | 5.2 |
| 20.9140625 | 0 |
| 20.921875 | -0.2 |
| 20.9296875 | -1 |
| 20.9375 | -5.3 |
| 20.9453125 | -6 |
| 20.953125 | -7.5 |
| 20.9609375 | -13.8 |
| 20.96875 | -13.1 |
| 20.9765625 | -6.8 |
| 20.984375 | -4.9 |
| 20.9921875 | -3.2 |
| 21.0 | 2 |
| 21.0078125 | 10.3 |
| 21.015625 | 19.9 |
| 21.0234375 | 24.1 |
| 21.03125 | 26.8 |
| 21.0390625 | 32.5 |
| 21.046875 | 35 |
| 21.0546875 | 38.4 |
| 21.0625 | 44.3 |
| 21.0703125 | 45.3 |
| 21.078125 | 49 |
| 21.0859375 | 56.5 |
| 21.09375 | 56.3 |
| 21.1015625 | 53.1 |
| 21.109375 | 50.9 |
| 21.1171875 | 47 |
| 21.125 | 45.2 |
| 21.1328125 | 41.5 |
| 21.140625 | 35.7 |
| 21.1484375 | 36.6 |
| 21.15625 | 36.3 |
| 21.1640625 | 31.1 |
| 21.171875 | 29.6 |
| 21.1796875 | 24.3 |
| 21.1875 | 12.1 |
| 21.1953125 | 4.2 |
| 21.203125 | 0.4 |
| 21.2109375 | -1.9 |
| 21.21875 | 0.9 |
| 21.2265625 | 5.8 |
| 21.234375 | 7.9 |
| 21.2421875 | 8.6 |
| 21.25 | 8.4 |
| 21.2578125 | 3.4 |
| 21.265625 | -3.9 |
| 21.2734375 | -7.7 |
| 21.28125 | -12 |
| 21.2890625 | -15.5 |
| 21.296875 | -11.1 |
| 21.3046875 | -6.8 |
| 21.3125 | -6.7 |
| 21.3203125 | -3.5 |
| 21.328125 | 0 |
| 21.3359375 | 2.3 |
| 21.34375 | 7.2 |
| 21.3515625 | 8.6 |
| 21.359375 | 4.7 |
| 21.3671875 | 2.3 |
| 21.375 | 0.2 |
| 21.3828125 | -5.4 |
| 21.390625 | -13.3 |
| 21.3984375 | -20.6 |
| 21.40625 | -22.8 |
| 21.4140625 | -22.4 |
| 21.421875 | -25.7 |
| 21.4296875 | -28.5 |
| 21.4375 | -27 |
| 21.4453125 | -25.9 |
| 21.453125 | -25.7 |
| 21.4609375 | -26.2 |
| 21.46875 | -28.6 |
| 21.4765625 | -28.4 |
| 21.484375 | -26.1 |
| 21.4921875 | -27 |
| 21.5 | -29.3 |
| 21.5078125 | -29.7 |
| 21.515625 | -27.9 |
| 21.5234375 | -21.7 |
| 21.53125 | -12.2 |
| 21.5390625 | -4.8 |
| 21.546875 | -3.3 |
| 21.5546875 | -8.8 |
| 21.5625 | -17.5 |
| 21.5703125 | -23.1 |
| 21.578125 | -23.7 |
| 21.5859375 | -21.7 |
| 21.59375 | -16.2 |
| 21.6015625 | -9.9 |
| 21.609375 | -8 |
| 21.6171875 | -7.6 |
| 21.625 | -6.1 |
| 21.6328125 | -6.5 |
| 21.640625 | -6.1 |
| 21.6484375 | -4.3 |
| 21.65625 | -5.5 |
| 21.6640625 | -7 |
| 21.671875 | -6.9 |
| 21.6796875 | -9.7 |
| 21.6875 | -14.9 |
| 21.6953125 | -17.9 |
| 21.703125 | -17.6 |
| 21.7109375 | -17.5 |
| 21.71875 | -20.6 |
| 21.7265625 | -23.7 |
| 21.734375 | -26.7 |
| 21.7421875 | -32 |
| 21.75 | -30.7 |
| 21.7578125 | -19.1 |
| 21.765625 | -10 |
| 21.7734375 | -7.6 |
| 21.78125 | -4.3 |
| 21.7890625 | -1.1 |
| 21.796875 | 0.6 |
| 21.8046875 | 4.2 |
| 21.8125 | 7.4 |
| 21.8203125 | 9.1 |
| 21.828125 | 12.2 |
| 21.8359375 | 15.8 |
| 21.84375 | 18.2 |
| 21.8515625 | 17.8 |
| 21.859375 | 13.9 |
| 21.8671875 | 10.4 |
| 21.875 | 7.4 |
| 21.8828125 | 3.3 |
| 21.890625 | 4.2 |
| 21.8984375 | 8.7 |
| 21.90625 | 12.1 |
| 21.9140625 | 19.1 |
| 21.921875 | 27.1 |
| 21.9296875 | 29.6 |
| 21.9375 | 30.6 |
| 21.9453125 | 30.6 |
| 21.953125 | 28.3 |
| 21.9609375 | 24.4 |
| 21.96875 | 14.6 |
| 21.9765625 | 3.4 |
| 21.984375 | -1.8 |
| 21.9921875 | -8.5 |
| 22.0 | -15.9 |
| 22.0078125 | -12.7 |
| 22.015625 | -4.6 |
| 22.0234375 | -2.3 |
| 22.03125 | -3.5 |
| 22.0390625 | -4.8 |
| 22.046875 | -4.7 |
| 22.0546875 | -1.2 |
| 22.0625 | 3.7 |
| 22.0703125 | 7.4 |
| 22.078125 | 8 |
| 22.0859375 | 7 |
| 22.09375 | 11.6 |
| 22.1015625 | 20.9 |
| 22.109375 | 27.5 |
| 22.1171875 | 34.2 |
| 22.125 | 38.7 |
| 22.1328125 | 33 |
| 22.140625 | 25.7 |
| 22.1484375 | 25 |
| 22.15625 | 24.2 |
| 22.1640625 | 20.5 |
| 22.171875 | 17.2 |
| 22.1796875 | 15.4 |
| 22.1875 | 13.7 |
| 22.1953125 | 7.5 |
| 22.203125 | 0.1 |
| 22.2109375 | -0.6 |
| 22.21875 | 1.6 |
| 22.2265625 | 1.1 |
| 22.234375 | -0.3 |
| 22.2421875 | -2 |
| 22.25 | -3.4 |
| 22.2578125 | -2.6 |
| 22.265625 | -3.3 |
| 22.2734375 | -8.6 |
| 22.28125 | -14.1 |
| 22.2890625 | -14.9 |
| 22.296875 | -9.2 |
| 22.3046875 | -1.1 |
| 22.3125 | 1 |
| 22.3203125 | 0.6 |
| 22.328125 | 3.7 |
| 22.3359375 | 2.8 |
| 22.34375 | -1.4 |
| 22.3515625 | 1 |
| 22.359375 | 6.2 |
| 22.3671875 | 9.2 |
| 22.375 | 13.6 |
| 22.3828125 | 18 |
| 22.390625 | 21.8 |
| 22.3984375 | 27.3 |
| 22.40625 | 31.7 |
| 22.4140625 | 32.1 |
| 22.421875 | 27.7 |
| 22.4296875 | 22.8 |
| 22.4375 | 23.3 |
| 22.4453125 | 25.1 |
| 22.453125 | 23.5 |
| 22.4609375 | 25.1 |
| 22.46875 | 31.6 |
| 22.4765625 | 34 |
| 22.484375 | 32.7 |
| 22.4921875 | 34.8 |
| 22.5 | 35 |
| 22.5078125 | 29.2 |
| 22.515625 | 23.4 |
| 22.5234375 | 20.3 |
| 22.53125 | 22.1 |
| 22.5390625 | 26.5 |
| 22.546875 | 24 |
| 22.5546875 | 18 |
| 22.5625 | 13.8 |
| 22.5703125 | 5.9 |
| 22.578125 | 0.5 |
| 22.5859375 | 0.7 |
| 22.59375 | -5.1 |
| 22.6015625 | -15 |
| 22.609375 | -24.4 |
| 22.6171875 | -36.1 |
| 22.625 | -41.2 |
| 22.6328125 | -35 |
| 22.640625 | -28.7 |
| 22.6484375 | -26.6 |
| 22.65625 | -22.7 |
| 22.6640625 | -16.3 |
| 22.671875 | -13.8 |
| 22.6796875 | -17.6 |
| 22.6875 | -21.7 |
| 22.6953125 | -23.3 |
| 22.703125 | -23.5 |
| 22.7109375 | -19.5 |
| 22.71875 | -10.7 |
| 22.7265625 | -2.7 |
| 22.734375 | 1.2 |
| 22.7421875 | 3.9 |
| 22.75 | 7.2 |
| 22.7578125 | 7.2 |
| 22.765625 | 3.8 |
| 22.7734375 | 2.8 |
| 22.78125 | 2.2 |
| 22.7890625 | -3.8 |
| 22.796875 | -10.5 |
| 22.8046875 | -12.8 |
| 22.8125 | -10.9 |
| 22.8203125 | -6.4 |
| 22.828125 | -4.7 |
| 22.8359375 | -6.5 |
| 22.84375 | -2.7 |
| 22.8515625 | 5.2 |
| 22.859375 | 9.6 |
| 22.8671875 | 14.2 |
| 22.875 | 19 |
| 22.8828125 | 19.7 |
| 22.890625 | 21 |
| 22.8984375 | 21 |
| 22.90625 | 14.5 |
| 22.9140625 | 7.1 |
| 22.921875 | -2.9 |
| 22.9296875 | -20.5 |
| 22.9375 | -36.3 |
| 22.9453125 | -47 |
| 22.953125 | -59.2 |
| 22.9609375 | -71.1 |
| 22.96875 | -77.6 |
| 22.9765625 | -78.7 |
| 22.984375 | -79.8 |
| 22.9921875 | -83.2 |
| 23.0 | -83.7 |
| 23.0078125 | -80 |
| 23.015625 | -76 |
| 23.0234375 | -67.9 |
| 23.03125 | -53.3 |
| 23.0390625 | -37.2 |
| 23.046875 | -20.5 |
| 23.0546875 | -1.5 |
| 23.0625 | 15 |
| 23.0703125 | 28 |
| 23.078125 | 38.6 |
| 23.0859375 | 43.4 |
| 23.09375 | 45 |
| 23.1015625 | 43.7 |
| 23.109375 | 36.7 |
| 23.1171875 | 32.3 |
| 23.125 | 30.8 |
| 23.1328125 | 25.2 |
| 23.140625 | 24.8 |
| 23.1484375 | 27.1 |
| 23.15625 | 19.7 |
| 23.1640625 | 11.5 |
| 23.171875 | 5.5 |
| 23.1796875 | -1.1 |
| 23.1875 | 2.5 |
| 23.1953125 | 10.5 |
| 23.203125 | 10.2 |
| 23.2109375 | 6 |
| 23.21875 | -0.1 |
| 23.2265625 | -9.6 |
| 23.234375 | -19.5 |
| 23.2421875 | -27.8 |
| 23.25 | -33.8 |
| 23.2578125 | -39 |
| 23.265625 | -42 |
| 23.2734375 | -40.2 |
| 23.28125 | -34.4 |
| 23.2890625 | -22.1 |
| 23.296875 | -7.4 |
| 23.3046875 | -0.5 |
| 23.3125 | 2.2 |
| 23.3203125 | 3.7 |
| 23.328125 | -0.6 |
| 23.3359375 | -4.6 |
| 23.34375 | -5.7 |
| 23.3515625 | -10.6 |
| 23.359375 | -13.6 |
| 23.3671875 | -7.2 |
| 23.375 | -1.5 |
| 23.3828125 | -1.2 |
| 23.390625 | 2.3 |
| 23.3984375 | 3.3 |
| 23.40625 | -6.7 |
| 23.4140625 | -13.6 |
| 23.421875 | -11 |
| 23.4296875 | -9.3 |
| 23.4375 | -7.2 |
| 23.4453125 | 0 |
| 23.453125 | 8 |
| 23.4609375 | 10.7 |
| 23.46875 | 2.8 |
| 23.4765625 | -10.8 |
| 23.484375 | -21.5 |
| 23.4921875 | -28.1 |
| 23.5 | -27.8 |
| 23.5078125 | -19.7 |
| 23.515625 | -7.6 |
| 23.5234375 | 8.6 |
| 23.53125 | 23.6 |
| 23.5390625 | 29.4 |
| 23.546875 | 28.3 |
| 23.5546875 | 20.4 |
| 23.5625 | 6.2 |
| 23.5703125 | -7.9 |
| 23.578125 | -19.1 |
| 23.5859375 | -20.7 |
| 23.59375 | -10.3 |
| 23.6015625 | 2.8 |
| 23.609375 | 20.1 |
| 23.6171875 | 42.1 |
| 23.625 | 55.1 |
| 23.6328125 | 55.9 |
| 23.640625 | 50.7 |
| 23.6484375 | 45.4 |
| 23.65625 | 46.9 |
| 23.6640625 | 50.4 |
| 23.671875 | 51.1 |
| 23.6796875 | 53.2 |
| 23.6875 | 54.6 |
| 23.6953125 | 54.9 |
| 23.703125 | 56.3 |
| 23.7109375 | 50.5 |
| 23.71875 | 34.2 |
| 23.7265625 | 13.9 |
| 23.734375 | -7.1 |
| 23.7421875 | -24.7 |
| 23.75 | -34.8 |
| 23.7578125 | -38.6 |
| 23.765625 | -36.7 |
| 23.7734375 | -28.5 |
| 23.78125 | -17.5 |
| 23.7890625 | -9.2 |
| 23.796875 | -6.1 |
| 23.8046875 | -5.9 |
| 23.8125 | -5.5 |
| 23.8203125 | -2.2 |
| 23.828125 | 7.4 |
| 23.8359375 | 20.4 |
| 23.84375 | 29.4 |
| 23.8515625 | 33.2 |
| 23.859375 | 33.5 |
| 23.8671875 | 32.3 |
| 23.875 | 31.8 |
| 23.8828125 | 26.9 |
| 23.890625 | 14.3 |
| 23.8984375 | 3.1 |
| 23.90625 | 0.6 |
| 23.9140625 | 3.9 |
| 23.921875 | 6.1 |
| 23.9296875 | 4.8 |
| 23.9375 | 3.1 |
| 23.9453125 | -1.4 |
| 23.953125 | -11.3 |
| 23.9609375 | -18.8 |
| 23.96875 | -23.9 |
| 23.9765625 | -30.2 |
| 23.984375 | -30.8 |
| 23.9921875 | -26.8 |
| 24.0 | -22.9 |
| 24.0078125 | -16.3 |
| 24.015625 | -11.6 |
| 24.0234375 | -16.2 |
| 24.03125 | -25.4 |
| 24.0390625 | -34.6 |
| 24.046875 | -41.8 |
| 24.0546875 | -40.2 |
| 24.0625 | -25.6 |
| 24.0703125 | -7.4 |
| 24.078125 | 3.5 |
| 24.0859375 | 14 |
| 24.09375 | 30.6 |
| 24.1015625 | 41.2 |
| 24.109375 | 43.2 |
| 24.1171875 | 46.8 |
| 24.125 | 47.3 |
| 24.1328125 | 39.1 |
| 24.140625 | 31.6 |
| 24.1484375 | 29.4 |
| 24.15625 | 29.2 |
| 24.1640625 | 29 |
| 24.171875 | 27.5 |
| 24.1796875 | 24.4 |
| 24.1875 | 18.8 |
| 24.1953125 | 10.3 |
| 24.203125 | 3.9 |
| 24.2109375 | -0.9 |
| 24.21875 | -9.6 |
| 24.2265625 | -16.3 |
| 24.234375 | -15.1 |
| 24.2421875 | -10.8 |
| 24.25 | -5.4 |
| 24.2578125 | -0.5 |
| 24.265625 | -1.7 |
| 24.2734375 | -9 |
| 24.28125 | -19.5 |
| 24.2890625 | -30.1 |
| 24.296875 | -34.5 |
| 24.3046875 | -30.9 |
| 24.3125 | -22.2 |
| 24.3203125 | -11.3 |
| 24.328125 | -3.3 |
| 24.3359375 | 0.1 |
| 24.34375 | 4.7 |
| 24.3515625 | 9.8 |
| 24.359375 | 6.7 |
| 24.3671875 | -2.6 |
| 24.375 | -10.8 |
| 24.3828125 | -16.4 |
| 24.390625 | -13.1 |
| 24.3984375 | 1.1 |
| 24.40625 | 12.5 |
| 24.4140625 | 18.4 |
| 24.421875 | 28.6 |
| 24.4296875 | 38.2 |
| 24.4375 | 40.1 |
| 24.4453125 | 39.9 |
| 24.453125 | 36.6 |
| 24.4609375 | 23.5 |
| 24.46875 | 10.1 |
| 24.4765625 | 8.5 |
| 24.484375 | 11.6 |
| 24.4921875 | 10.2 |
| 24.5 | 8.3 |
| 24.5078125 | 4.7 |
| 24.515625 | -2.5 |
| 24.5234375 | -4.4 |
| 24.53125 | -2.2 |
| 24.5390625 | -3.6 |
| 24.546875 | -1 |
| 24.5546875 | 7.1 |
| 24.5625 | 11.4 |
| 24.5703125 | 16.2 |
| 24.578125 | 23.8 |
| 24.5859375 | 26.1 |
| 24.59375 | 22.8 |
| 24.6015625 | 15.8 |
| 24.609375 | 6.6 |
| 24.6171875 | 0.9 |
| 24.625 | -0.4 |
| 24.6328125 | -1.5 |
| 24.640625 | -5.6 |
| 24.6484375 | -11 |
| 24.65625 | -11.3 |
| 24.6640625 | -4.9 |
| 24.671875 | 6.1 |
| 24.6796875 | 13.9 |
| 24.6875 | 9 |
| 24.6953125 | -1.1 |
| 24.703125 | -9.7 |
| 24.7109375 | -22.5 |
| 24.71875 | -26.8 |
| 24.7265625 | -11.3 |
| 24.734375 | 6.8 |
| 24.7421875 | 19.6 |
| 24.75 | 30.6 |
| 24.7578125 | 35.6 |
| 24.765625 | 36.5 |
| 24.7734375 | 36.1 |
| 24.78125 | 34.8 |
| 24.7890625 | 35.1 |
| 24.796875 | 31.4 |
| 24.8046875 | 20.9 |
| 24.8125 | 9 |
| 24.8203125 | -6.6 |
| 24.828125 | -27 |
| 24.8359375 | -45.5 |
| 24.84375 | -58.3 |
| 24.8515625 | -61.6 |
| 24.859375 | -54.3 |
| 24.8671875 | -42.6 |
| 24.875 | -31 |
| 24.8828125 | -20.5 |
| 24.890625 | -11.2 |
| 24.8984375 | -2.4 |
| 24.90625 | 8.8 |
| 24.9140625 | 23.3 |
| 24.921875 | 33.4 |
| 24.9296875 | 34.4 |
| 24.9375 | 28.2 |
| 24.9453125 | 10 |
| 24.953125 | -18.9 |
| 24.9609375 | -46.6 |
| 24.96875 | -69.3 |
| 24.9765625 | -84.6 |
| 24.984375 | -88.5 |
| 24.9921875 | -82.5 |
| 25.0 | -64.7 |
| 25.0078125 | -43 |
| 25.015625 | -31.2 |
| 25.0234375 | -21.5 |
| 25.03125 | -6.8 |
| 25.0390625 | 5.1 |
| 25.046875 | 14.6 |
| 25.0546875 | 21.6 |
| 25.0625 | 19.2 |
| 25.0703125 | 8.2 |
| 25.078125 | -10.2 |
| 25.0859375 | -35.3 |
| 25.09375 | -62.2 |
| 25.1015625 | -85.8 |
| 25.109375 | -97.9 |
| 25.1171875 | -97.7 |
| 25.125 | -91.8 |
| 25.1328125 | -81 |
| 25.140625 | -66.4 |
| 25.1484375 | -50.9 |
| 25.15625 | -31.7 |
| 25.1640625 | -10.2 |
| 25.171875 | 7.9 |
| 25.1796875 | 18.4 |
| 25.1875 | 19.1 |
| 25.1953125 | 17.2 |
| 25.203125 | 15.9 |
| 25.2109375 | 8.3 |
| 25.21875 | -5.4 |
| 25.2265625 | -20.8 |
| 25.234375 | -32.7 |
| 25.2421875 | -36.9 |
| 25.25 | -40.2 |
| 25.2578125 | -42.4 |
| 25.265625 | -37 |
| 25.2734375 | -32.7 |
| 25.28125 | -32 |
| 25.2890625 | -29 |
| 25.296875 | -26.8 |
| 25.3046875 | -18.3 |
| 25.3125 | -0.7 |
| 25.3203125 | 7.8 |
| 25.328125 | 5.5 |
| 25.3359375 | 1.1 |
| 25.34375 | -8 |
| 25.3515625 | -11.8 |
| 25.359375 | -5.6 |
| 25.3671875 | -6.3 |
| 25.375 | -11.7 |
| 25.3828125 | -9.6 |
| 25.390625 | -9.5 |
| 25.3984375 | -15.4 |
| 25.40625 | -16.7 |
| 25.4140625 | -13.4 |
| 25.421875 | -11.2 |
| 25.4296875 | -10.2 |
| 25.4375 | -8.7 |
| 25.4453125 | -7.1 |
| 25.453125 | -6.5 |
| 25.4609375 | -3.8 |
| 25.46875 | 1.5 |
| 25.4765625 | 1.9 |
| 25.484375 | -2 |
| 25.4921875 | -2.4 |
| 25.5 | 0.5 |
| 25.5078125 | 8.4 |
| 25.515625 | 19.5 |
| 25.5234375 | 23.1 |
| 25.53125 | 20.9 |
| 25.5390625 | 23.1 |
| 25.546875 | 27.6 |
| 25.5546875 | 29 |
| 25.5625 | 28.6 |
| 25.5703125 | 29.7 |
| 25.578125 | 35.5 |
| 25.5859375 | 41.6 |
| 25.59375 | 42.6 |
| 25.6015625 | 44.5 |
| 25.609375 | 49.9 |
| 25.6171875 | 49.4 |
| 25.625 | 44.4 |
| 25.6328125 | 42.3 |
| 25.640625 | 38.5 |
| 25.6484375 | 31.4 |
| 25.65625 | 26.5 |
| 25.6640625 | 24.3 |
| 25.671875 | 22.9 |
| 25.6796875 | 20.6 |
| 25.6875 | 18.7 |
| 25.6953125 | 24.2 |
| 25.703125 | 31.9 |
| 25.7109375 | 31.6 |
| 25.71875 | 31.1 |
| 25.7265625 | 36.7 |
| 25.734375 | 42.7 |
| 25.7421875 | 50.7 |
| 25.75 | 60.3 |
| 25.7578125 | 65.2 |
| 25.765625 | 68 |
| 25.7734375 | 69.1 |
| 25.78125 | 64 |
| 25.7890625 | 57.5 |
| 25.796875 | 53.9 |
| 25.8046875 | 52.2 |
| 25.8125 | 57.9 |
| 25.8203125 | 68.7 |
| 25.828125 | 71.9 |
| 25.8359375 | 70.6 |
| 25.84375 | 71.5 |
| 25.8515625 | 62.2 |
| 25.859375 | 41.1 |
| 25.8671875 | 22.9 |
| 25.875 | 9.9 |
| 25.8828125 | -0.3 |
| 25.890625 | -8.8 |
| 25.8984375 | -18.4 |
| 25.90625 | -22.8 |
| 25.9140625 | -22.7 |
| 25.921875 | -27.3 |
| 25.9296875 | -31.9 |
| 25.9375 | -30.3 |
| 25.9453125 | -23.8 |
| 25.953125 | -11.6 |
| 25.9609375 | -0.4 |
| 25.96875 | 3.7 |
| 25.9765625 | 6.5 |
| 25.984375 | 12.5 |
| 25.9921875 | 20.3 |
| 26.0 | 29.1 |
| 26.0078125 | 39 |
| 26.015625 | 43.6 |
| 26.0234375 | 36.8 |
| 26.03125 | 27.4 |
| 26.0390625 | 19.8 |
| 26.046875 | 10.2 |
| 26.0546875 | 4.5 |
| 26.0625 | 0.7 |
| 26.0703125 | -7.4 |
| 26.078125 | -12.2 |
| 26.0859375 | -12.7 |
| 26.09375 | -15.5 |
| 26.1015625 | -20.4 |
| 26.109375 | -25.9 |
| 26.1171875 | -28.2 |
| 26.125 | -25.3 |
| 26.1328125 | -21.2 |
| 26.140625 | -14.4 |
| 26.1484375 | -7.4 |
| 26.15625 | -7.1 |
| 26.1640625 | -8 |
| 26.171875 | -3.3 |
| 26.1796875 | 2.5 |
| 26.1875 | 3.9 |
| 26.1953125 | 3.2 |
| 26.203125 | 5.3 |
| 26.2109375 | 5.4 |
| 26.21875 | -2.4 |
| 26.2265625 | -11 |
| 26.234375 | -15 |
| 26.2421875 | -16.2 |
| 26.25 | -11.5 |
| 26.2578125 | -3.4 |
| 26.265625 | 1 |
| 26.2734375 | 5.5 |
| 26.28125 | 13.2 |
| 26.2890625 | 21.4 |
| 26.296875 | 31.7 |
| 26.3046875 | 42 |
| 26.3125 | 45.6 |
| 26.3203125 | 41.5 |
| 26.328125 | 30.3 |
| 26.3359375 | 14.7 |
| 26.34375 | -1 |
| 26.3515625 | -16.7 |
| 26.359375 | -31.5 |
| 26.3671875 | -41.6 |
| 26.375 | -45 |
| 26.3828125 | -42.3 |
| 26.390625 | -41 |
| 26.3984375 | -45.6 |
| 26.40625 | -50.4 |
| 26.4140625 | -54.3 |
| 26.421875 | -59.4 |
| 26.4296875 | -62.4 |
| 26.4375 | -62.5 |
| 26.4453125 | -63.1 |
| 26.453125 | -65.5 |
| 26.4609375 | -67.8 |
| 26.46875 | -66.6 |
| 26.4765625 | -60.4 |
| 26.484375 | -52.7 |
| 26.4921875 | -51.2 |
| 26.5 | -56 |
| 26.5078125 | -55.5 |
| 26.515625 | -51 |
| 26.5234375 | -51.4 |
| 26.53125 | -51.3 |
| 26.5390625 | -50.2 |
| 26.546875 | -51.8 |
| 26.5546875 | -49.5 |
| 26.5625 | -45.1 |
| 26.5703125 | -46 |
| 26.578125 | -46 |
| 26.5859375 | -39.8 |
| 26.59375 | -28.3 |
| 26.6015625 | -13.2 |
| 26.609375 | -0.4 |
| 26.6171875 | 5.9 |
| 26.625 | 9.2 |
| 26.6328125 | 13.2 |
| 26.640625 | 15.7 |
| 26.6484375 | 12.8 |
| 26.65625 | 8.5 |
| 26.6640625 | 8.8 |
| 26.671875 | 11.1 |
| 26.6796875 | 11.3 |
| 26.6875 | 11.3 |
| 26.6953125 | 13.6 |
| 26.703125 | 17.1 |
| 26.7109375 | 15.7 |
| 26.71875 | 6.8 |
| 26.7265625 | 2.7 |
| 26.734375 | 8.5 |
| 26.7421875 | 12.7 |
| 26.75 | 12.9 |
| 26.7578125 | 13.6 |
| 26.765625 | 15.7 |
| 26.7734375 | 20.3 |
| 26.78125 | 23 |
| 26.7890625 | 20.8 |
| 26.796875 | 17.7 |
| 26.8046875 | 14 |
| 26.8125 | 12.3 |
| 26.8203125 | 13.7 |
| 26.828125 | 10.8 |
| 26.8359375 | 6.7 |
| 26.84375 | 9.3 |
| 26.8515625 | 11.5 |
| 26.859375 | 8.5 |
| 26.8671875 | 7.9 |
| 26.875 | 11.9 |
| 26.8828125 | 12.5 |
| 26.890625 | 9.6 |
| 26.8984375 | 11.9 |
| 26.90625 | 15.6 |
| 26.9140625 | 14.9 |
| 26.921875 | 16.7 |
| 26.9296875 | 21.6 |
| 26.9375 | 24.9 |
| 26.9453125 | 29.5 |
| 26.953125 | 32.1 |
| 26.9609375 | 27.1 |
| 26.96875 | 22 |
| 26.9765625 | 20.9 |
| 26.984375 | 18.1 |
| 26.9921875 | 15.4 |
| 27.0 | 15.8 |
| 27.0078125 | 14.3 |
| 27.015625 | 10.2 |
| 27.0234375 | 5.9 |
| 27.03125 | 0 |
| 27.0390625 | -3.5 |
| 27.046875 | -2.5 |
| 27.0546875 | -4.7 |
| 27.0625 | -8 |
| 27.0703125 | -5.7 |
| 27.078125 | -2 |
| 27.0859375 | 0.6 |
| 27.09375 | 4 |
| 27.1015625 | 8.9 |
| 27.109375 | 14.6 |
| 27.1171875 | 15.8 |
| 27.125 | 13.3 |
| 27.1328125 | 13.5 |
| 27.140625 | 14.3 |
| 27.1484375 | 13.4 |
| 27.15625 | 11.4 |
| 27.1640625 | 6.9 |
| 27.171875 | 2 |
| 27.1796875 | -1.1 |
| 27.1875 | -0.8 |
| 27.1953125 | 5.2 |
| 27.203125 | 12.1 |
| 27.2109375 | 19.2 |
| 27.21875 | 28.2 |
| 27.2265625 | 31.5 |
| 27.234375 | 34.6 |
| 27.2421875 | 44.7 |
| 27.25 | 47.7 |
| 27.2578125 | 42 |
| 27.265625 | 37.7 |
| 27.2734375 | 30.2 |
| 27.28125 | 21.8 |
| 27.2890625 | 18 |
| 27.296875 | 15.1 |
| 27.3046875 | 14.7 |
| 27.3125 | 15.9 |
| 27.3203125 | 18 |
| 27.328125 | 25.8 |
| 27.3359375 | 29.6 |
| 27.34375 | 24.3 |
| 27.3515625 | 22.8 |
| 27.359375 | 25.9 |
| 27.3671875 | 27.3 |
| 27.375 | 24.3 |
| 27.3828125 | 16.2 |
| 27.390625 | 11.5 |
| 27.3984375 | 10.1 |
| 27.40625 | 6 |
| 27.4140625 | 4.1 |
| 27.421875 | -0.6 |
| 27.4296875 | -11.1 |
| 27.4375 | -10.1 |
| 27.4453125 | -5.2 |
| 27.453125 | -17.3 |
| 27.4609375 | -31.6 |
| 27.46875 | -37.2 |
| 27.4765625 | -43.6 |
| 27.484375 | -45.2 |
| 27.4921875 | -40.3 |
| 27.5 | -38.5 |
| 27.5078125 | -34.7 |
| 27.515625 | -26.1 |
| 27.5234375 | -20.4 |
| 27.53125 | -15.8 |
| 27.5390625 | -13.1 |
| 27.546875 | -16.3 |
| 27.5546875 | -18.8 |
| 27.5625 | -21.7 |
| 27.5703125 | -29.9 |
| 27.578125 | -33.6 |
| 27.5859375 | -29.5 |
| 27.59375 | -26.8 |
| 27.6015625 | -24 |
| 27.609375 | -18.5 |
| 27.6171875 | -16.6 |
| 27.625 | -17.8 |
| 27.6328125 | -19.3 |
| 27.640625 | -23.5 |
| 27.6484375 | -25.3 |
| 27.65625 | -23.1 |
| 27.6640625 | -25.1 |
| 27.671875 | -27.8 |
| 27.6796875 | -26.2 |
| 27.6875 | -27 |
| 27.6953125 | -30.7 |
| 27.703125 | -34.4 |
| 27.7109375 | -39.4 |
| 27.71875 | -40.7 |
| 27.7265625 | -38.3 |
| 27.734375 | -36 |
| 27.7421875 | -32.2 |
| 27.75 | -29.8 |
| 27.7578125 | -31.5 |
| 27.765625 | -30.3 |
| 27.7734375 | -26.4 |
| 27.78125 | -26.2 |
| 27.7890625 | -27.6 |
| 27.796875 | -26.6 |
| 27.8046875 | -23.6 |
| 27.8125 | -20.7 |
| 27.8203125 | -21 |
| 27.828125 | -24.5 |
| 27.8359375 | -27.3 |
| 27.84375 | -27.4 |
| 27.8515625 | -26 |
| 27.859375 | -24.2 |
| 27.8671875 | -23.3 |
| 27.875 | -24.1 |
| 27.8828125 | -25 |
| 27.890625 | -24.7 |
| 27.8984375 | -20.8 |
| 27.90625 | -13.5 |
| 27.9140625 | -9.2 |
| 27.921875 | -9.1 |
| 27.9296875 | -8.4 |
| 27.9375 | -8 |
| 27.9453125 | -8.2 |
| 27.953125 | -4.6 |
| 27.9609375 | 1.1 |
| 27.96875 | 5.4 |
| 27.9765625 | 9.3 |
| 27.984375 | 11.2 |
| 27.9921875 | 12.6 |
| 28.0 | 17.9 |
| 28.0078125 | 21.8 |
| 28.015625 | 20 |
| 28.0234375 | 17.3 |
| 28.03125 | 11.9 |
| 28.0390625 | 4.6 |
| 28.046875 | 4.8 |
| 28.0546875 | 5.5 |
| 28.0625 | -0.1 |
| 28.0703125 | 2.1 |
| 28.078125 | 12.4 |
| 28.0859375 | 17.1 |
| 28.09375 | 17.7 |
| 28.1015625 | 16.7 |
| 28.109375 | 14.4 |
| 28.1171875 | 14.7 |
| 28.125 | 11.9 |
| 28.1328125 | 2 |
| 28.140625 | -6.8 |
| 28.1484375 | -11.8 |
| 28.15625 | -15.1 |
| 28.1640625 | -14.7 |
| 28.171875 | -7.8 |
| 28.1796875 | 1.1 |
| 28.1875 | 4.7 |
| 28.1953125 | 6.8 |
| 28.203125 | 13.7 |
| 28.2109375 | 18.9 |
| 28.21875 | 19.1 |
| 28.2265625 | 21.6 |
| 28.234375 | 29.2 |
| 28.2421875 | 39.2 |
| 28.25 | 49.3 |
| 28.2578125 | 56.3 |
| 28.265625 | 57 |
| 28.2734375 | 55.8 |
| 28.28125 | 56.6 |
| 28.2890625 | 52.2 |
| 28.296875 | 43.5 |
| 28.3046875 | 42 |
| 28.3125 | 43.2 |
| 28.3203125 | 37.6 |
| 28.328125 | 27.4 |
| 28.3359375 | 17.3 |
| 28.34375 | 13.2 |
| 28.3515625 | 13.5 |
| 28.359375 | 9.9 |
| 28.3671875 | 8.3 |
| 28.375 | 12.6 |
| 28.3828125 | 14.4 |
| 28.390625 | 13.1 |
| 28.3984375 | 10.1 |
| 28.40625 | 5.1 |
| 28.4140625 | 2.9 |
| 28.421875 | 0.8 |
| 28.4296875 | -1.9 |
| 28.4375 | 3.8 |
| 28.4453125 | 12 |
| 28.453125 | 12.8 |
| 28.4609375 | 12.2 |
| 28.46875 | 8.8 |
| 28.4765625 | 0.9 |
| 28.484375 | 5.5 |
| 28.4921875 | 19.6 |
| 28.5 | 23.7 |
| 28.5078125 | 22.8 |
| 28.515625 | 23.4 |
| 28.5234375 | 22.6 |
| 28.53125 | 26.1 |
| 28.5390625 | 27.4 |
| 28.546875 | 18.5 |
| 28.5546875 | 10.9 |
| 28.5625 | 8.4 |
| 28.5703125 | 4.9 |
| 28.578125 | 3.3 |
| 28.5859375 | 5.9 |
| 28.59375 | 9.3 |
| 28.6015625 | 9.2 |
| 28.609375 | 6.4 |
| 28.6171875 | 4.2 |
| 28.625 | -1.4 |
| 28.6328125 | -11.3 |
| 28.640625 | -18.9 |
| 28.6484375 | -21 |
| 28.65625 | -15.1 |
| 28.6640625 | -5 |
| 28.671875 | -1.6 |
| 28.6796875 | -1.7 |
| 28.6875 | 2.9 |
| 28.6953125 | 5 |
| 28.703125 | -2.7 |
| 28.7109375 | -13.3 |
| 28.71875 | -17.7 |
| 28.7265625 | -17.2 |
| 28.734375 | -14.4 |
| 28.7421875 | -6.2 |
| 28.75 | 3.1 |
| 28.7578125 | 9.3 |
| 28.765625 | 14.4 |
| 28.7734375 | 9.9 |
| 28.78125 | -6.4 |
| 28.7890625 | -15.6 |
| 28.796875 | -13.8 |
| 28.8046875 | -12.6 |
| 28.8125 | -9.4 |
| 28.8203125 | -1.2 |
| 28.828125 | 4.8 |
| 28.8359375 | 5.9 |
| 28.84375 | 0.4 |
| 28.8515625 | -9.6 |
| 28.859375 | -16.2 |
| 28.8671875 | -20 |
| 28.875 | -20.8 |
| 28.8828125 | -13.5 |
| 28.890625 | -3.2 |
| 28.8984375 | 5.5 |
| 28.90625 | 14.6 |
| 28.9140625 | 20 |
| 28.921875 | 19 |
| 28.9296875 | 14.7 |
| 28.9375 | 8.2 |
| 28.9453125 | 3.9 |
| 28.953125 | 4 |
| 28.9609375 | 5.3 |
| 28.96875 | 9.4 |
| 28.9765625 | 14 |
| 28.984375 | 13.3 |
| 28.9921875 | 12.6 |
| 29.0 | 12.7 |
| 29.0078125 | 3.6 |
| 29.015625 | -14.1 |
| 29.0234375 | -28.7 |
| 29.03125 | -35.2 |
| 29.0390625 | -38 |
| 29.046875 | -38.1 |
| 29.0546875 | -28.8 |
| 29.0625 | -14.7 |
| 29.0703125 | -7.1 |
| 29.078125 | -5 |
| 29.0859375 | -5.5 |
| 29.09375 | -8.1 |
| 29.1015625 | -9.4 |
| 29.109375 | -12.1 |
| 29.1171875 | -17.3 |
| 29.125 | -18.7 |
| 29.1328125 | -18.9 |
| 29.140625 | -20.8 |
| 29.1484375 | -22 |
| 29.15625 | -29.1 |
| 29.1640625 | -40.1 |
| 29.171875 | -43.3 |
| 29.1796875 | -43.1 |
| 29.1875 | -43.2 |
| 29.1953125 | -37.4 |
| 29.203125 | -26.7 |
| 29.2109375 | -11.7 |
| 29.21875 | 4.4 |
| 29.2265625 | 11.3 |
| 29.234375 | 13.7 |
| 29.2421875 | 18.3 |
| 29.25 | 15.2 |
| 29.2578125 | 4.8 |
| 29.265625 | -4.4 |
| 29.2734375 | -9.9 |
| 29.28125 | -6.1 |
| 29.2890625 | 6.2 |
| 29.296875 | 20.8 |
| 29.3046875 | 38.7 |
| 29.3125 | 53.8 |
| 29.3203125 | 56.6 |
| 29.328125 | 48.2 |
| 29.3359375 | 35.1 |
| 29.34375 | 27.6 |
| 29.3515625 | 25.4 |
| 29.359375 | 19.8 |
| 29.3671875 | 15.8 |
| 29.375 | 19.5 |
| 29.3828125 | 29.2 |
| 29.390625 | 43.6 |
| 29.3984375 | 53.3 |
| 29.40625 | 50.2 |
| 29.4140625 | 35.9 |
| 29.421875 | 13 |
| 29.4296875 | -10.1 |
| 29.4375 | -26.9 |
| 29.4453125 | -42.7 |
| 29.453125 | -52.5 |
| 29.4609375 | -45.5 |
| 29.46875 | -27.9 |
| 29.4765625 | -12.4 |
| 29.484375 | -4 |
| 29.4921875 | -2.7 |
| 29.5 | -8.6 |
| 29.5078125 | -19.5 |
| 29.515625 | -28.6 |
| 29.5234375 | -30.6 |
| 29.53125 | -25.1 |
| 29.5390625 | -14.1 |
| 29.546875 | -2.8 |
| 29.5546875 | 3.8 |
| 29.5625 | 8.4 |
| 29.5703125 | 17.8 |
| 29.578125 | 28.2 |
| 29.5859375 | 26.9 |
| 29.59375 | 13.7 |
| 29.6015625 | 3.1 |
| 29.609375 | -0.7 |
| 29.6171875 | -6.7 |
| 29.625 | -11.4 |
| 29.6328125 | -5.9 |
| 29.640625 | 2.7 |
| 29.6484375 | 9 |
| 29.65625 | 16.2 |
| 29.6640625 | 17.3 |
| 29.671875 | 8.5 |
| 29.6796875 | -1.5 |
| 29.6875 | -5.8 |
| 29.6953125 | -1.6 |
| 29.703125 | 2.1 |
| 29.7109375 | -3.7 |
| 29.71875 | -6.4 |
| 29.7265625 | -2.3 |
| 29.734375 | -3 |
| 29.7421875 | -3.4 |
| 29.75 | -2.5 |
| 29.7578125 | -10.7 |
| 29.765625 | -20.7 |
| 29.7734375 | -27.3 |
| 29.78125 | -36 |
| 29.7890625 | -40.7 |
| 29.796875 | -39.5 |
| 29.8046875 | -41.3 |
| 29.8125 | -42.8 |
| 29.8203125 | -41.6 |
| 29.828125 | -48.2 |
| 29.8359375 | -59.7 |
| 29.84375 | -61 |
| 29.8515625 | -53.7 |
| 29.859375 | -45.9 |
| 29.8671875 | -36 |
| 29.875 | -26.1 |
| 29.8828125 | -19.7 |
| 29.890625 | -14.5 |
| 29.8984375 | -10.9 |
| 29.90625 | -7.5 |
| 29.9140625 | -3.6 |
| 29.921875 | -1.9 |
| 29.9296875 | 0.4 |
| 29.9375 | 7 |
| 29.9453125 | 16.4 |
| 29.953125 | 29.3 |
| 29.9609375 | 41.6 |
| 29.96875 | 48.6 |
| 29.9765625 | 53.4 |
| 29.984375 | 52.6 |
| 29.9921875 | 41.1 |
| 30.0 | 27.1 |
| 30.0078125 | 17.2 |
| 30.015625 | 8.6 |
| 30.0234375 | 2.3 |
| 30.03125 | 0.9 |
| 30.0390625 | 0.2 |
| 30.046875 | -3.2 |
| 30.0546875 | -8.4 |
| 30.0625 | -15.2 |
| 30.0703125 | -22.5 |
| 30.078125 | -28.5 |
| 30.0859375 | -35.4 |
| 30.09375 | -42.1 |
| 30.1015625 | -41.5 |
| 30.109375 | -32.7 |
| 30.1171875 | -23.8 |
| 30.125 | -16.7 |
| 30.1328125 | -10.7 |
| 30.140625 | -8.9 |
| 30.1484375 | -9 |
| 30.15625 | -9.8 |
| 30.1640625 | -14.4 |
| 30.171875 | -16.1 |
| 30.1796875 | -9.8 |
| 30.1875 | -2 |
| 30.1953125 | 5.3 |
| 30.203125 | 13.1 |
| 30.2109375 | 17.3 |
| 30.21875 | 17.7 |
| 30.2265625 | 15.3 |
| 30.234375 | 8.8 |
| 30.2421875 | 2.9 |
| 30.25 | 2.7 |
| 30.2578125 | 6.2 |
| 30.265625 | 11.6 |
| 30.2734375 | 19.7 |
| 30.28125 | 25.9 |
| 30.2890625 | 28 |
| 30.296875 | 28.9 |
| 30.3046875 | 22.7 |
| 30.3125 | 12.2 |
| 30.3203125 | 12.9 |
| 30.328125 | 17.4 |
| 30.3359375 | 14 |
| 30.34375 | 15.6 |
| 30.3515625 | 27 |
| 30.359375 | 36.9 |
| 30.3671875 | 41.3 |
| 30.375 | 39.3 |
| 30.3828125 | 32.7 |
| 30.390625 | 26.9 |
| 30.3984375 | 21.2 |
| 30.40625 | 15.4 |
| 30.4140625 | 11 |
| 30.421875 | 6.4 |
| 30.4296875 | 6.5 |
| 30.4375 | 18.4 |
| 30.4453125 | 35.1 |
| 30.453125 | 42.8 |
| 30.4609375 | 40.8 |
| 30.46875 | 35.6 |
| 30.4765625 | 26.6 |
| 30.484375 | 14.8 |
| 30.4921875 | 7.5 |
| 30.5 | 7.7 |
| 30.5078125 | 8.8 |
| 30.515625 | 7.1 |
| 30.5234375 | 11.8 |
| 30.53125 | 20.5 |
| 30.5390625 | 17.4 |
| 30.546875 | 10.3 |
| 30.5546875 | 9.3 |
| 30.5625 | 4.5 |
| 30.5703125 | -0.8 |
| 30.578125 | 0.3 |
| 30.5859375 | 0.3 |
| 30.59375 | 1.3 |
| 30.6015625 | 6.3 |
| 30.609375 | 12.4 |
| 30.6171875 | 19.8 |
| 30.625 | 24.9 |
| 30.6328125 | 28.5 |
| 30.640625 | 32.7 |
| 30.6484375 | 32.2 |
| 30.65625 | 31.8 |
| 30.6640625 | 33.5 |
| 30.671875 | 27.7 |
| 30.6796875 | 21 |
| 30.6875 | 19.4 |
| 30.6953125 | 15.3 |
| 30.703125 | 12.6 |
| 30.7109375 | 12.4 |
| 30.71875 | 2.2 |
| 30.7265625 | -11 |
| 30.734375 | -13.5 |
| 30.7421875 | -14 |
| 30.75 | -20 |
| 30.7578125 | -24.3 |
| 30.765625 | -27.2 |
| 30.7734375 | -31.8 |
| 30.78125 | -34.4 |
| 30.7890625 | -34.8 |
| 30.796875 | -33.4 |
| 30.8046875 | -29.9 |
| 30.8125 | -26.7 |
| 30.8203125 | -21.4 |
| 30.828125 | -13.6 |
| 30.8359375 | -12.7 |
| 30.84375 | -17.6 |
| 30.8515625 | -18 |
| 30.859375 | -16.2 |
| 30.8671875 | -19.7 |
| 30.875 | -24.3 |
| 30.8828125 | -22.5 |
| 30.890625 | -16.9 |
| 30.8984375 | -13.4 |
| 30.90625 | -14 |
| 30.9140625 | -14.2 |
| 30.921875 | -9.1 |
| 30.9296875 | -4.7 |
| 30.9375 | -6.6 |
| 30.9453125 | -6.6 |
| 30.953125 | -1.4 |
| 30.9609375 | 3.9 |
| 30.96875 | 8.6 |
| 30.9765625 | 12.5 |
| 30.984375 | 15.8 |
| 30.9921875 | 20.5 |
| 31.0 | 23.1 |
| 31.0078125 | 21.2 |
| 31.015625 | 16.9 |
| 31.0234375 | 11.6 |
| 31.03125 | 8.3 |
| 31.0390625 | 6.1 |
| 31.046875 | -2.9 |
| 31.0546875 | -15 |
| 31.0625 | -18.4 |
| 31.0703125 | -16 |
| 31.078125 | -14.5 |
| 31.0859375 | -11 |
| 31.09375 | -5.2 |
| 31.1015625 | -0.5 |
| 31.109375 | 3.1 |
| 31.1171875 | 5.8 |
| 31.125 | 9.2 |
| 31.1328125 | 12.2 |
| 31.140625 | 9.7 |
| 31.1484375 | 5 |
| 31.15625 | 4.7 |
| 31.1640625 | 7.1 |
| 31.171875 | 7.4 |
| 31.1796875 | 3.6 |
| 31.1875 | 1 |
| 31.1953125 | 4.2 |
| 31.203125 | 7.1 |
| 31.2109375 | 9 |
| 31.21875 | 16 |
| 31.2265625 | 21.3 |
| 31.234375 | 19.6 |
| 31.2421875 | 18.1 |
| 31.25 | 17.4 |
| 31.2578125 | 16.2 |
| 31.265625 | 17 |
| 31.2734375 | 17.2 |
| 31.28125 | 14.7 |
| 31.2890625 | 11.8 |
| 31.296875 | 10.4 |
| 31.3046875 | 12 |
| 31.3125 | 11.2 |
| 31.3203125 | 5.7 |
| 31.328125 | 3.6 |
| 31.3359375 | 3.3 |
| 31.34375 | -2.8 |
| 31.3515625 | -10.8 |
| 31.359375 | -16.5 |
| 31.3671875 | -21.9 |
| 31.375 | -27.2 |
| 31.3828125 | -29 |
| 31.390625 | -24.4 |
| 31.3984375 | -17.1 |
| 31.40625 | -13.3 |
| 31.4140625 | -14.2 |
| 31.421875 | -16.5 |
| 31.4296875 | -14.3 |
| 31.4375 | -11.1 |
| 31.4453125 | -14.9 |
| 31.453125 | -18 |
| 31.4609375 | -14.4 |
| 31.46875 | -12.7 |
| 31.4765625 | -15.7 |
| 31.484375 | -20.3 |
| 31.4921875 | -18.9 |
| 31.5 | -7.8 |
| 31.5078125 | -1.5 |
| 31.515625 | -6.8 |
| 31.5234375 | -12.5 |
| 31.53125 | -16.1 |
| 31.5390625 | -17.3 |
| 31.546875 | -14.7 |
| 31.5546875 | -16.7 |
| 31.5625 | -19.8 |
| 31.5703125 | -15.6 |
| 31.578125 | -11.6 |
| 31.5859375 | -12.4 |
| 31.59375 | -13.6 |
| 31.6015625 | -15.1 |
| 31.609375 | -16.6 |
| 31.6171875 | -17.4 |
| 31.625 | -18 |
| 31.6328125 | -18.4 |
| 31.640625 | -20.6 |
| 31.6484375 | -25.9 |
| 31.65625 | -29.1 |
| 31.6640625 | -24.4 |
| 31.671875 | -17.8 |
| 31.6796875 | -20 |
| 31.6875 | -24.5 |
| 31.6953125 | -20.6 |
| 31.703125 | -18.3 |
| 31.7109375 | -22.2 |
| 31.71875 | -20.5 |
| 31.7265625 | -16.5 |
| 31.734375 | -20 |
| 31.7421875 | -20.3 |
| 31.75 | -11.4 |
| 31.7578125 | -6.1 |
| 31.765625 | -7.1 |
| 31.7734375 | -9.8 |
| 31.78125 | -13.6 |
| 31.7890625 | -14.9 |
| 31.796875 | -15.2 |
| 31.8046875 | -17.6 |
| 31.8125 | -14.5 |
| 31.8203125 | -8.9 |
| 31.828125 | -10 |
| 31.8359375 | -8.7 |
| 31.84375 | 0 |
| 31.8515625 | 4.1 |
| 31.859375 | 1.1 |
| 31.8671875 | 0.2 |
| 31.875 | 1.9 |
| 31.8828125 | 0.6 |
| 31.890625 | -0.9 |
| 31.8984375 | 2.2 |
| 31.90625 | 6.7 |
| 31.9140625 | 10.1 |
| 31.921875 | 14.5 |
| 31.9296875 | 18.5 |
| 31.9375 | 20.3 |
| 31.9453125 | 22.3 |
| 31.953125 | 27.4 |
| 31.9609375 | 31.7 |
| 31.96875 | 29.4 |
| 31.9765625 | 26.7 |
| 31.984375 | 30.1 |
| 31.9921875 | 31.2 |